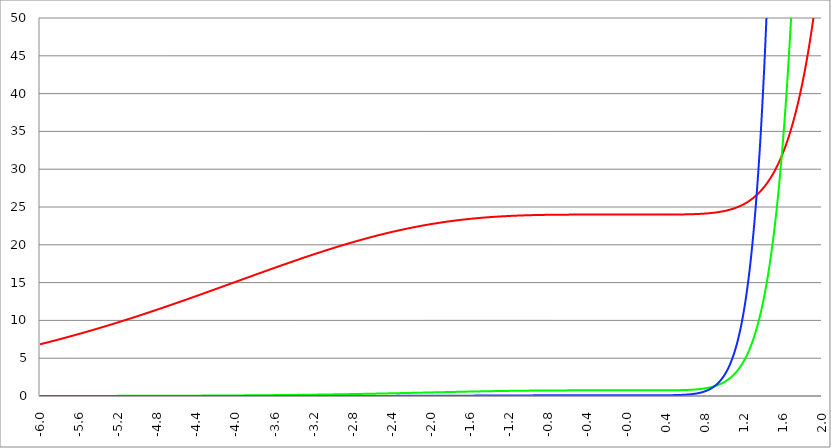
| Category | Series 1 | Series 0 | Series 2 |
|---|---|---|---|
| -6.0 | 6.841 | 0.006 | 0 |
| -5.996 | 6.854 | 0.006 | 0 |
| -5.992000000000001 | 6.867 | 0.006 | 0 |
| -5.988000000000001 | 6.88 | 0.006 | 0 |
| -5.984000000000002 | 6.893 | 0.006 | 0 |
| -5.980000000000002 | 6.906 | 0.006 | 0 |
| -5.976000000000002 | 6.919 | 0.006 | 0 |
| -5.972000000000003 | 6.932 | 0.006 | 0 |
| -5.968000000000003 | 6.945 | 0.006 | 0 |
| -5.964000000000004 | 6.958 | 0.006 | 0 |
| -5.960000000000004 | 6.971 | 0.006 | 0 |
| -5.956000000000004 | 6.984 | 0.006 | 0 |
| -5.952000000000005 | 6.997 | 0.006 | 0 |
| -5.948000000000005 | 7.01 | 0.006 | 0 |
| -5.944000000000006 | 7.023 | 0.006 | 0 |
| -5.940000000000006 | 7.036 | 0.006 | 0 |
| -5.936000000000007 | 7.049 | 0.006 | 0 |
| -5.932000000000007 | 7.062 | 0.006 | 0 |
| -5.928000000000008 | 7.075 | 0.006 | 0 |
| -5.924000000000008 | 7.089 | 0.006 | 0 |
| -5.920000000000009 | 7.102 | 0.006 | 0 |
| -5.91600000000001 | 7.115 | 0.006 | 0 |
| -5.91200000000001 | 7.128 | 0.006 | 0 |
| -5.90800000000001 | 7.141 | 0.006 | 0 |
| -5.904000000000011 | 7.155 | 0.007 | 0 |
| -5.900000000000011 | 7.168 | 0.007 | 0 |
| -5.896000000000011 | 7.181 | 0.007 | 0 |
| -5.892000000000012 | 7.195 | 0.007 | 0 |
| -5.888000000000012 | 7.208 | 0.007 | 0 |
| -5.884000000000013 | 7.221 | 0.007 | 0 |
| -5.880000000000013 | 7.235 | 0.007 | 0 |
| -5.876000000000014 | 7.248 | 0.007 | 0 |
| -5.872000000000014 | 7.261 | 0.007 | 0 |
| -5.868000000000014 | 7.275 | 0.007 | 0 |
| -5.864000000000015 | 7.288 | 0.007 | 0 |
| -5.860000000000015 | 7.302 | 0.007 | 0 |
| -5.856000000000016 | 7.315 | 0.007 | 0 |
| -5.852000000000016 | 7.329 | 0.007 | 0 |
| -5.848000000000017 | 7.342 | 0.007 | 0 |
| -5.844000000000017 | 7.356 | 0.007 | 0 |
| -5.840000000000018 | 7.369 | 0.007 | 0 |
| -5.836000000000018 | 7.383 | 0.007 | 0 |
| -5.832000000000018 | 7.396 | 0.007 | 0 |
| -5.828000000000019 | 7.41 | 0.007 | 0 |
| -5.824000000000019 | 7.423 | 0.007 | 0 |
| -5.82000000000002 | 7.437 | 0.007 | 0 |
| -5.81600000000002 | 7.451 | 0.007 | 0 |
| -5.812000000000021 | 7.464 | 0.007 | 0 |
| -5.808000000000021 | 7.478 | 0.007 | 0 |
| -5.804000000000022 | 7.492 | 0.007 | 0 |
| -5.800000000000022 | 7.505 | 0.008 | 0 |
| -5.796000000000022 | 7.519 | 0.008 | 0 |
| -5.792000000000023 | 7.533 | 0.008 | 0 |
| -5.788000000000023 | 7.546 | 0.008 | 0 |
| -5.784000000000024 | 7.56 | 0.008 | 0 |
| -5.780000000000024 | 7.574 | 0.008 | 0 |
| -5.776000000000024 | 7.588 | 0.008 | 0 |
| -5.772000000000025 | 7.602 | 0.008 | 0 |
| -5.768000000000025 | 7.615 | 0.008 | 0 |
| -5.764000000000026 | 7.629 | 0.008 | 0 |
| -5.760000000000026 | 7.643 | 0.008 | 0 |
| -5.756000000000026 | 7.657 | 0.008 | 0 |
| -5.752000000000027 | 7.671 | 0.008 | 0 |
| -5.748000000000027 | 7.685 | 0.008 | 0 |
| -5.744000000000028 | 7.699 | 0.008 | 0 |
| -5.740000000000028 | 7.713 | 0.008 | 0 |
| -5.73600000000003 | 7.727 | 0.008 | 0 |
| -5.73200000000003 | 7.741 | 0.008 | 0 |
| -5.72800000000003 | 7.755 | 0.008 | 0 |
| -5.72400000000003 | 7.769 | 0.008 | 0 |
| -5.720000000000031 | 7.783 | 0.008 | 0 |
| -5.716000000000031 | 7.797 | 0.008 | 0 |
| -5.712000000000032 | 7.811 | 0.008 | 0 |
| -5.708000000000032 | 7.825 | 0.009 | 0 |
| -5.704000000000033 | 7.839 | 0.009 | 0 |
| -5.700000000000033 | 7.853 | 0.009 | 0 |
| -5.696000000000033 | 7.867 | 0.009 | 0 |
| -5.692000000000034 | 7.881 | 0.009 | 0 |
| -5.688000000000034 | 7.896 | 0.009 | 0 |
| -5.684000000000035 | 7.91 | 0.009 | 0 |
| -5.680000000000035 | 7.924 | 0.009 | 0 |
| -5.676000000000035 | 7.938 | 0.009 | 0 |
| -5.672000000000036 | 7.952 | 0.009 | 0 |
| -5.668000000000036 | 7.967 | 0.009 | 0 |
| -5.664000000000037 | 7.981 | 0.009 | 0 |
| -5.660000000000037 | 7.995 | 0.009 | 0 |
| -5.656000000000038 | 8.01 | 0.009 | 0 |
| -5.652000000000038 | 8.024 | 0.009 | 0 |
| -5.648000000000039 | 8.038 | 0.009 | 0 |
| -5.644000000000039 | 8.053 | 0.009 | 0 |
| -5.64000000000004 | 8.067 | 0.009 | 0 |
| -5.63600000000004 | 8.081 | 0.009 | 0 |
| -5.63200000000004 | 8.096 | 0.009 | 0 |
| -5.628000000000041 | 8.11 | 0.01 | 0 |
| -5.624000000000041 | 8.125 | 0.01 | 0 |
| -5.620000000000042 | 8.139 | 0.01 | 0 |
| -5.616000000000042 | 8.154 | 0.01 | 0 |
| -5.612000000000043 | 8.168 | 0.01 | 0 |
| -5.608000000000043 | 8.183 | 0.01 | 0 |
| -5.604000000000044 | 8.197 | 0.01 | 0 |
| -5.600000000000044 | 8.212 | 0.01 | 0 |
| -5.596000000000044 | 8.226 | 0.01 | 0 |
| -5.592000000000045 | 8.241 | 0.01 | 0 |
| -5.588000000000045 | 8.255 | 0.01 | 0 |
| -5.584000000000046 | 8.27 | 0.01 | 0 |
| -5.580000000000046 | 8.285 | 0.01 | 0 |
| -5.576000000000046 | 8.299 | 0.01 | 0 |
| -5.572000000000047 | 8.314 | 0.01 | 0 |
| -5.568000000000048 | 8.329 | 0.01 | 0 |
| -5.564000000000048 | 8.343 | 0.01 | 0 |
| -5.560000000000048 | 8.358 | 0.01 | 0 |
| -5.556000000000049 | 8.373 | 0.011 | 0 |
| -5.552000000000049 | 8.387 | 0.011 | 0 |
| -5.54800000000005 | 8.402 | 0.011 | 0 |
| -5.54400000000005 | 8.417 | 0.011 | 0 |
| -5.540000000000051 | 8.432 | 0.011 | 0 |
| -5.536000000000051 | 8.446 | 0.011 | 0 |
| -5.532000000000052 | 8.461 | 0.011 | 0 |
| -5.528000000000052 | 8.476 | 0.011 | 0 |
| -5.524000000000052 | 8.491 | 0.011 | 0 |
| -5.520000000000053 | 8.506 | 0.011 | 0 |
| -5.516000000000053 | 8.521 | 0.011 | 0 |
| -5.512000000000054 | 8.536 | 0.011 | 0 |
| -5.508000000000054 | 8.551 | 0.011 | 0 |
| -5.504000000000055 | 8.565 | 0.011 | 0 |
| -5.500000000000055 | 8.58 | 0.011 | 0 |
| -5.496000000000055 | 8.595 | 0.011 | 0 |
| -5.492000000000056 | 8.61 | 0.011 | 0 |
| -5.488000000000056 | 8.625 | 0.012 | 0 |
| -5.484000000000057 | 8.64 | 0.012 | 0 |
| -5.480000000000057 | 8.655 | 0.012 | 0 |
| -5.476000000000057 | 8.67 | 0.012 | 0 |
| -5.472000000000058 | 8.686 | 0.012 | 0 |
| -5.468000000000059 | 8.701 | 0.012 | 0 |
| -5.464000000000059 | 8.716 | 0.012 | 0 |
| -5.460000000000059 | 8.731 | 0.012 | 0 |
| -5.45600000000006 | 8.746 | 0.012 | 0 |
| -5.45200000000006 | 8.761 | 0.012 | 0 |
| -5.44800000000006 | 8.776 | 0.012 | 0 |
| -5.444000000000061 | 8.791 | 0.012 | 0 |
| -5.440000000000061 | 8.807 | 0.012 | 0 |
| -5.436000000000062 | 8.822 | 0.012 | 0 |
| -5.432000000000062 | 8.837 | 0.012 | 0 |
| -5.428000000000063 | 8.852 | 0.012 | 0 |
| -5.424000000000063 | 8.868 | 0.013 | 0 |
| -5.420000000000064 | 8.883 | 0.013 | 0 |
| -5.416000000000064 | 8.898 | 0.013 | 0 |
| -5.412000000000064 | 8.913 | 0.013 | 0 |
| -5.408000000000065 | 8.929 | 0.013 | 0 |
| -5.404000000000065 | 8.944 | 0.013 | 0 |
| -5.400000000000066 | 8.959 | 0.013 | 0 |
| -5.396000000000066 | 8.975 | 0.013 | 0 |
| -5.392000000000067 | 8.99 | 0.013 | 0 |
| -5.388000000000067 | 9.006 | 0.013 | 0 |
| -5.384000000000068 | 9.021 | 0.013 | 0 |
| -5.380000000000068 | 9.036 | 0.013 | 0 |
| -5.376000000000068 | 9.052 | 0.013 | 0 |
| -5.37200000000007 | 9.067 | 0.013 | 0 |
| -5.36800000000007 | 9.083 | 0.014 | 0 |
| -5.36400000000007 | 9.098 | 0.014 | 0 |
| -5.36000000000007 | 9.114 | 0.014 | 0 |
| -5.356000000000071 | 9.129 | 0.014 | 0 |
| -5.352000000000071 | 9.145 | 0.014 | 0 |
| -5.348000000000072 | 9.161 | 0.014 | 0 |
| -5.344000000000072 | 9.176 | 0.014 | 0 |
| -5.340000000000073 | 9.192 | 0.014 | 0 |
| -5.336000000000073 | 9.207 | 0.014 | 0 |
| -5.332000000000074 | 9.223 | 0.014 | 0 |
| -5.328000000000074 | 9.239 | 0.014 | 0 |
| -5.324000000000074 | 9.254 | 0.014 | 0 |
| -5.320000000000075 | 9.27 | 0.014 | 0 |
| -5.316000000000075 | 9.286 | 0.014 | 0 |
| -5.312000000000076 | 9.301 | 0.015 | 0 |
| -5.308000000000076 | 9.317 | 0.015 | 0 |
| -5.304000000000077 | 9.333 | 0.015 | 0 |
| -5.300000000000077 | 9.348 | 0.015 | 0 |
| -5.296000000000077 | 9.364 | 0.015 | 0 |
| -5.292000000000078 | 9.38 | 0.015 | 0 |
| -5.288000000000078 | 9.396 | 0.015 | 0 |
| -5.284000000000079 | 9.412 | 0.015 | 0 |
| -5.28000000000008 | 9.427 | 0.015 | 0 |
| -5.27600000000008 | 9.443 | 0.015 | 0 |
| -5.27200000000008 | 9.459 | 0.015 | 0 |
| -5.268000000000081 | 9.475 | 0.015 | 0 |
| -5.264000000000081 | 9.491 | 0.016 | 0 |
| -5.260000000000081 | 9.507 | 0.016 | 0 |
| -5.256000000000082 | 9.523 | 0.016 | 0 |
| -5.252000000000082 | 9.539 | 0.016 | 0 |
| -5.248000000000083 | 9.555 | 0.016 | 0 |
| -5.244000000000083 | 9.571 | 0.016 | 0 |
| -5.240000000000084 | 9.586 | 0.016 | 0 |
| -5.236000000000084 | 9.602 | 0.016 | 0 |
| -5.232000000000084 | 9.618 | 0.016 | 0 |
| -5.228000000000085 | 9.635 | 0.016 | 0 |
| -5.224000000000085 | 9.651 | 0.016 | 0 |
| -5.220000000000086 | 9.667 | 0.016 | 0 |
| -5.216000000000086 | 9.683 | 0.017 | 0 |
| -5.212000000000087 | 9.699 | 0.017 | 0 |
| -5.208000000000087 | 9.715 | 0.017 | 0 |
| -5.204000000000088 | 9.731 | 0.017 | 0 |
| -5.200000000000088 | 9.747 | 0.017 | 0 |
| -5.196000000000089 | 9.763 | 0.017 | 0 |
| -5.192000000000089 | 9.779 | 0.017 | 0 |
| -5.188000000000089 | 9.796 | 0.017 | 0 |
| -5.18400000000009 | 9.812 | 0.017 | 0 |
| -5.18000000000009 | 9.828 | 0.017 | 0 |
| -5.176000000000091 | 9.844 | 0.017 | 0 |
| -5.172000000000091 | 9.86 | 0.018 | 0 |
| -5.168000000000092 | 9.877 | 0.018 | 0 |
| -5.164000000000092 | 9.893 | 0.018 | 0 |
| -5.160000000000092 | 9.909 | 0.018 | 0 |
| -5.156000000000093 | 9.925 | 0.018 | 0 |
| -5.152000000000093 | 9.942 | 0.018 | 0 |
| -5.148000000000094 | 9.958 | 0.018 | 0 |
| -5.144000000000094 | 9.974 | 0.018 | 0 |
| -5.140000000000095 | 9.991 | 0.018 | 0 |
| -5.136000000000095 | 10.007 | 0.018 | 0 |
| -5.132000000000096 | 10.023 | 0.018 | 0 |
| -5.128000000000096 | 10.04 | 0.019 | 0 |
| -5.124000000000096 | 10.056 | 0.019 | 0 |
| -5.120000000000097 | 10.073 | 0.019 | 0 |
| -5.116000000000097 | 10.089 | 0.019 | 0 |
| -5.112000000000098 | 10.106 | 0.019 | 0 |
| -5.108000000000098 | 10.122 | 0.019 | 0 |
| -5.104000000000099 | 10.139 | 0.019 | 0 |
| -5.100000000000099 | 10.155 | 0.019 | 0 |
| -5.0960000000001 | 10.172 | 0.019 | 0 |
| -5.0920000000001 | 10.188 | 0.019 | 0 |
| -5.0880000000001 | 10.205 | 0.02 | 0 |
| -5.084000000000101 | 10.221 | 0.02 | 0 |
| -5.080000000000101 | 10.238 | 0.02 | 0 |
| -5.076000000000101 | 10.254 | 0.02 | 0 |
| -5.072000000000102 | 10.271 | 0.02 | 0 |
| -5.068000000000103 | 10.287 | 0.02 | 0 |
| -5.064000000000103 | 10.304 | 0.02 | 0 |
| -5.060000000000104 | 10.321 | 0.02 | 0 |
| -5.056000000000104 | 10.337 | 0.02 | 0 |
| -5.052000000000104 | 10.354 | 0.021 | 0 |
| -5.048000000000104 | 10.371 | 0.021 | 0 |
| -5.044000000000105 | 10.387 | 0.021 | 0 |
| -5.040000000000105 | 10.404 | 0.021 | 0 |
| -5.036000000000106 | 10.421 | 0.021 | 0 |
| -5.032000000000106 | 10.438 | 0.021 | 0 |
| -5.028000000000107 | 10.454 | 0.021 | 0 |
| -5.024000000000107 | 10.471 | 0.021 | 0 |
| -5.020000000000108 | 10.488 | 0.021 | 0 |
| -5.016000000000108 | 10.505 | 0.021 | 0 |
| -5.012000000000109 | 10.521 | 0.022 | 0 |
| -5.00800000000011 | 10.538 | 0.022 | 0 |
| -5.00400000000011 | 10.555 | 0.022 | 0 |
| -5.00000000000011 | 10.572 | 0.022 | 0 |
| -4.99600000000011 | 10.589 | 0.022 | 0 |
| -4.992000000000111 | 10.606 | 0.022 | 0 |
| -4.988000000000111 | 10.622 | 0.022 | 0 |
| -4.984000000000112 | 10.639 | 0.022 | 0 |
| -4.980000000000112 | 10.656 | 0.023 | 0 |
| -4.976000000000112 | 10.673 | 0.023 | 0 |
| -4.972000000000113 | 10.69 | 0.023 | 0 |
| -4.968000000000114 | 10.707 | 0.023 | 0 |
| -4.964000000000114 | 10.724 | 0.023 | 0 |
| -4.960000000000114 | 10.741 | 0.023 | 0 |
| -4.956000000000114 | 10.758 | 0.023 | 0 |
| -4.952000000000115 | 10.775 | 0.023 | 0 |
| -4.948000000000115 | 10.792 | 0.023 | 0 |
| -4.944000000000116 | 10.809 | 0.024 | 0 |
| -4.940000000000116 | 10.826 | 0.024 | 0 |
| -4.936000000000117 | 10.843 | 0.024 | 0 |
| -4.932000000000117 | 10.86 | 0.024 | 0 |
| -4.928000000000118 | 10.877 | 0.024 | 0 |
| -4.924000000000118 | 10.894 | 0.024 | 0 |
| -4.920000000000119 | 10.911 | 0.024 | 0 |
| -4.91600000000012 | 10.929 | 0.024 | 0 |
| -4.91200000000012 | 10.946 | 0.025 | 0 |
| -4.90800000000012 | 10.963 | 0.025 | 0 |
| -4.90400000000012 | 10.98 | 0.025 | 0 |
| -4.90000000000012 | 10.997 | 0.025 | 0 |
| -4.896000000000121 | 11.014 | 0.025 | 0 |
| -4.892000000000122 | 11.031 | 0.025 | 0 |
| -4.888000000000122 | 11.049 | 0.025 | 0 |
| -4.884000000000123 | 11.066 | 0.025 | 0 |
| -4.880000000000123 | 11.083 | 0.026 | 0 |
| -4.876000000000123 | 11.1 | 0.026 | 0 |
| -4.872000000000124 | 11.118 | 0.026 | 0 |
| -4.868000000000124 | 11.135 | 0.026 | 0 |
| -4.864000000000125 | 11.152 | 0.026 | 0 |
| -4.860000000000125 | 11.169 | 0.026 | 0 |
| -4.856000000000125 | 11.187 | 0.026 | 0 |
| -4.852000000000126 | 11.204 | 0.027 | 0 |
| -4.848000000000126 | 11.221 | 0.027 | 0 |
| -4.844000000000127 | 11.239 | 0.027 | 0 |
| -4.840000000000127 | 11.256 | 0.027 | 0 |
| -4.836000000000128 | 11.273 | 0.027 | 0 |
| -4.832000000000128 | 11.291 | 0.027 | 0 |
| -4.82800000000013 | 11.308 | 0.027 | 0 |
| -4.824000000000129 | 11.326 | 0.027 | 0 |
| -4.82000000000013 | 11.343 | 0.028 | 0 |
| -4.81600000000013 | 11.36 | 0.028 | 0 |
| -4.812000000000131 | 11.378 | 0.028 | 0 |
| -4.808000000000131 | 11.395 | 0.028 | 0 |
| -4.804000000000132 | 11.413 | 0.028 | 0 |
| -4.800000000000132 | 11.43 | 0.028 | 0 |
| -4.796000000000132 | 11.448 | 0.028 | 0 |
| -4.792000000000133 | 11.465 | 0.029 | 0 |
| -4.788000000000133 | 11.483 | 0.029 | 0 |
| -4.784000000000134 | 11.5 | 0.029 | 0 |
| -4.780000000000134 | 11.518 | 0.029 | 0 |
| -4.776000000000134 | 11.535 | 0.029 | 0 |
| -4.772000000000135 | 11.553 | 0.029 | 0 |
| -4.768000000000135 | 11.57 | 0.03 | 0 |
| -4.764000000000136 | 11.588 | 0.03 | 0 |
| -4.760000000000136 | 11.606 | 0.03 | 0 |
| -4.756000000000136 | 11.623 | 0.03 | 0 |
| -4.752000000000137 | 11.641 | 0.03 | 0 |
| -4.748000000000137 | 11.658 | 0.03 | 0 |
| -4.744000000000138 | 11.676 | 0.03 | 0 |
| -4.740000000000138 | 11.694 | 0.031 | 0 |
| -4.73600000000014 | 11.711 | 0.031 | 0 |
| -4.73200000000014 | 11.729 | 0.031 | 0 |
| -4.72800000000014 | 11.747 | 0.031 | 0 |
| -4.72400000000014 | 11.764 | 0.031 | 0 |
| -4.720000000000141 | 11.782 | 0.031 | 0 |
| -4.716000000000141 | 11.8 | 0.032 | 0 |
| -4.712000000000142 | 11.817 | 0.032 | 0 |
| -4.708000000000142 | 11.835 | 0.032 | 0 |
| -4.704000000000143 | 11.853 | 0.032 | 0 |
| -4.700000000000143 | 11.871 | 0.032 | 0 |
| -4.696000000000143 | 11.888 | 0.032 | 0 |
| -4.692000000000144 | 11.906 | 0.032 | 0 |
| -4.688000000000144 | 11.924 | 0.033 | 0 |
| -4.684000000000145 | 11.942 | 0.033 | 0 |
| -4.680000000000145 | 11.96 | 0.033 | 0 |
| -4.676000000000145 | 11.977 | 0.033 | 0 |
| -4.672000000000146 | 11.995 | 0.033 | 0 |
| -4.668000000000147 | 12.013 | 0.033 | 0 |
| -4.664000000000147 | 12.031 | 0.034 | 0 |
| -4.660000000000147 | 12.049 | 0.034 | 0 |
| -4.656000000000148 | 12.067 | 0.034 | 0 |
| -4.652000000000148 | 12.084 | 0.034 | 0 |
| -4.648000000000149 | 12.102 | 0.034 | 0 |
| -4.644000000000149 | 12.12 | 0.034 | 0 |
| -4.64000000000015 | 12.138 | 0.035 | 0 |
| -4.63600000000015 | 12.156 | 0.035 | 0 |
| -4.632000000000151 | 12.174 | 0.035 | 0 |
| -4.628000000000151 | 12.192 | 0.035 | 0 |
| -4.624000000000151 | 12.21 | 0.035 | 0 |
| -4.620000000000152 | 12.228 | 0.036 | 0 |
| -4.616000000000152 | 12.246 | 0.036 | 0 |
| -4.612000000000153 | 12.264 | 0.036 | 0 |
| -4.608000000000153 | 12.282 | 0.036 | 0 |
| -4.604000000000154 | 12.3 | 0.036 | 0 |
| -4.600000000000154 | 12.318 | 0.036 | 0 |
| -4.596000000000154 | 12.336 | 0.037 | 0 |
| -4.592000000000155 | 12.354 | 0.037 | 0 |
| -4.588000000000155 | 12.372 | 0.037 | 0 |
| -4.584000000000156 | 12.39 | 0.037 | 0 |
| -4.580000000000156 | 12.408 | 0.037 | 0 |
| -4.576000000000156 | 12.426 | 0.038 | 0 |
| -4.572000000000157 | 12.444 | 0.038 | 0 |
| -4.568000000000158 | 12.462 | 0.038 | 0 |
| -4.564000000000158 | 12.48 | 0.038 | 0 |
| -4.560000000000159 | 12.498 | 0.038 | 0 |
| -4.55600000000016 | 12.516 | 0.038 | 0 |
| -4.552000000000159 | 12.534 | 0.039 | 0 |
| -4.54800000000016 | 12.552 | 0.039 | 0 |
| -4.54400000000016 | 12.571 | 0.039 | 0 |
| -4.54000000000016 | 12.589 | 0.039 | 0 |
| -4.53600000000016 | 12.607 | 0.039 | 0 |
| -4.532000000000161 | 12.625 | 0.04 | 0 |
| -4.528000000000162 | 12.643 | 0.04 | 0 |
| -4.524000000000163 | 12.661 | 0.04 | 0 |
| -4.520000000000163 | 12.679 | 0.04 | 0 |
| -4.516000000000163 | 12.698 | 0.04 | 0 |
| -4.512000000000164 | 12.716 | 0.041 | 0 |
| -4.508000000000164 | 12.734 | 0.041 | 0 |
| -4.504000000000164 | 12.752 | 0.041 | 0 |
| -4.500000000000165 | 12.77 | 0.041 | 0 |
| -4.496000000000165 | 12.789 | 0.041 | 0 |
| -4.492000000000166 | 12.807 | 0.042 | 0 |
| -4.488000000000166 | 12.825 | 0.042 | 0 |
| -4.484000000000166 | 12.843 | 0.042 | 0 |
| -4.480000000000167 | 12.862 | 0.042 | 0 |
| -4.476000000000167 | 12.88 | 0.042 | 0 |
| -4.472000000000168 | 12.898 | 0.043 | 0 |
| -4.468000000000168 | 12.917 | 0.043 | 0 |
| -4.46400000000017 | 12.935 | 0.043 | 0 |
| -4.46000000000017 | 12.953 | 0.043 | 0 |
| -4.45600000000017 | 12.971 | 0.044 | 0 |
| -4.45200000000017 | 12.99 | 0.044 | 0 |
| -4.44800000000017 | 13.008 | 0.044 | 0 |
| -4.444000000000171 | 13.026 | 0.044 | 0 |
| -4.440000000000171 | 13.045 | 0.044 | 0 |
| -4.436000000000172 | 13.063 | 0.045 | 0 |
| -4.432000000000172 | 13.081 | 0.045 | 0 |
| -4.428000000000173 | 13.1 | 0.045 | 0 |
| -4.424000000000174 | 13.118 | 0.045 | 0 |
| -4.420000000000174 | 13.136 | 0.045 | 0 |
| -4.416000000000174 | 13.155 | 0.046 | 0 |
| -4.412000000000174 | 13.173 | 0.046 | 0 |
| -4.408000000000175 | 13.192 | 0.046 | 0 |
| -4.404000000000175 | 13.21 | 0.046 | 0 |
| -4.400000000000176 | 13.228 | 0.047 | 0 |
| -4.396000000000176 | 13.247 | 0.047 | 0 |
| -4.392000000000177 | 13.265 | 0.047 | 0 |
| -4.388000000000177 | 13.284 | 0.047 | 0 |
| -4.384000000000178 | 13.302 | 0.047 | 0 |
| -4.380000000000178 | 13.321 | 0.048 | 0 |
| -4.376000000000178 | 13.339 | 0.048 | 0 |
| -4.37200000000018 | 13.357 | 0.048 | 0 |
| -4.36800000000018 | 13.376 | 0.048 | 0 |
| -4.36400000000018 | 13.394 | 0.049 | 0 |
| -4.360000000000181 | 13.413 | 0.049 | 0 |
| -4.356000000000181 | 13.431 | 0.049 | 0 |
| -4.352000000000181 | 13.45 | 0.049 | 0 |
| -4.348000000000182 | 13.468 | 0.05 | 0 |
| -4.344000000000182 | 13.487 | 0.05 | 0 |
| -4.340000000000183 | 13.505 | 0.05 | 0 |
| -4.336000000000183 | 13.524 | 0.05 | 0 |
| -4.332000000000184 | 13.542 | 0.051 | 0 |
| -4.328000000000184 | 13.561 | 0.051 | 0 |
| -4.324000000000185 | 13.579 | 0.051 | 0 |
| -4.320000000000185 | 13.598 | 0.051 | 0 |
| -4.316000000000185 | 13.616 | 0.052 | 0 |
| -4.312000000000186 | 13.635 | 0.052 | 0 |
| -4.308000000000186 | 13.653 | 0.052 | 0 |
| -4.304000000000187 | 13.672 | 0.052 | 0 |
| -4.300000000000187 | 13.691 | 0.053 | 0 |
| -4.296000000000187 | 13.709 | 0.053 | 0 |
| -4.292000000000188 | 13.728 | 0.053 | 0 |
| -4.288000000000188 | 13.746 | 0.053 | 0 |
| -4.284000000000189 | 13.765 | 0.054 | 0 |
| -4.28000000000019 | 13.783 | 0.054 | 0 |
| -4.27600000000019 | 13.802 | 0.054 | 0 |
| -4.27200000000019 | 13.821 | 0.054 | 0 |
| -4.268000000000191 | 13.839 | 0.055 | 0 |
| -4.264000000000191 | 13.858 | 0.055 | 0 |
| -4.260000000000192 | 13.876 | 0.055 | 0 |
| -4.256000000000192 | 13.895 | 0.055 | 0 |
| -4.252000000000192 | 13.914 | 0.056 | 0 |
| -4.248000000000193 | 13.932 | 0.056 | 0 |
| -4.244000000000193 | 13.951 | 0.056 | 0 |
| -4.240000000000194 | 13.969 | 0.056 | 0 |
| -4.236000000000194 | 13.988 | 0.057 | 0 |
| -4.232000000000194 | 14.007 | 0.057 | 0 |
| -4.228000000000195 | 14.025 | 0.057 | 0 |
| -4.224000000000196 | 14.044 | 0.058 | 0 |
| -4.220000000000196 | 14.063 | 0.058 | 0 |
| -4.216000000000196 | 14.081 | 0.058 | 0 |
| -4.212000000000197 | 14.1 | 0.058 | 0 |
| -4.208000000000197 | 14.119 | 0.059 | 0 |
| -4.204000000000198 | 14.137 | 0.059 | 0 |
| -4.200000000000198 | 14.156 | 0.059 | 0 |
| -4.196000000000199 | 14.175 | 0.059 | 0 |
| -4.192000000000199 | 14.193 | 0.06 | 0.001 |
| -4.1880000000002 | 14.212 | 0.06 | 0.001 |
| -4.1840000000002 | 14.231 | 0.06 | 0.001 |
| -4.1800000000002 | 14.249 | 0.061 | 0.001 |
| -4.176000000000201 | 14.268 | 0.061 | 0.001 |
| -4.172000000000201 | 14.287 | 0.061 | 0.001 |
| -4.168000000000202 | 14.305 | 0.061 | 0.001 |
| -4.164000000000202 | 14.324 | 0.062 | 0.001 |
| -4.160000000000203 | 14.343 | 0.062 | 0.001 |
| -4.156000000000203 | 14.361 | 0.062 | 0.001 |
| -4.152000000000204 | 14.38 | 0.063 | 0.001 |
| -4.148000000000204 | 14.399 | 0.063 | 0.001 |
| -4.144000000000204 | 14.417 | 0.063 | 0.001 |
| -4.140000000000205 | 14.436 | 0.064 | 0.001 |
| -4.136000000000205 | 14.455 | 0.064 | 0.001 |
| -4.132000000000206 | 14.474 | 0.064 | 0.001 |
| -4.128000000000206 | 14.492 | 0.064 | 0.001 |
| -4.124000000000207 | 14.511 | 0.065 | 0.001 |
| -4.120000000000207 | 14.53 | 0.065 | 0.001 |
| -4.116000000000207 | 14.548 | 0.065 | 0.001 |
| -4.112000000000208 | 14.567 | 0.066 | 0.001 |
| -4.108000000000208 | 14.586 | 0.066 | 0.001 |
| -4.104000000000209 | 14.605 | 0.066 | 0.001 |
| -4.100000000000209 | 14.623 | 0.067 | 0.001 |
| -4.09600000000021 | 14.642 | 0.067 | 0.001 |
| -4.09200000000021 | 14.661 | 0.067 | 0.001 |
| -4.088000000000211 | 14.68 | 0.067 | 0.001 |
| -4.084000000000211 | 14.698 | 0.068 | 0.001 |
| -4.080000000000211 | 14.717 | 0.068 | 0.001 |
| -4.076000000000212 | 14.736 | 0.068 | 0.001 |
| -4.072000000000212 | 14.755 | 0.069 | 0.001 |
| -4.068000000000213 | 14.773 | 0.069 | 0.001 |
| -4.064000000000213 | 14.792 | 0.069 | 0.001 |
| -4.060000000000214 | 14.811 | 0.07 | 0.001 |
| -4.056000000000214 | 14.83 | 0.07 | 0.001 |
| -4.052000000000215 | 14.848 | 0.07 | 0.001 |
| -4.048000000000215 | 14.867 | 0.071 | 0.001 |
| -4.044000000000215 | 14.886 | 0.071 | 0.001 |
| -4.040000000000216 | 14.905 | 0.071 | 0.001 |
| -4.036000000000216 | 14.923 | 0.072 | 0.001 |
| -4.032000000000217 | 14.942 | 0.072 | 0.001 |
| -4.028000000000217 | 14.961 | 0.072 | 0.001 |
| -4.024000000000218 | 14.98 | 0.073 | 0.001 |
| -4.020000000000218 | 14.998 | 0.073 | 0.001 |
| -4.016000000000219 | 15.017 | 0.073 | 0.001 |
| -4.012000000000219 | 15.036 | 0.074 | 0.001 |
| -4.008000000000219 | 15.055 | 0.074 | 0.001 |
| -4.00400000000022 | 15.073 | 0.074 | 0.001 |
| -4.00000000000022 | 15.092 | 0.075 | 0.001 |
| -3.99600000000022 | 15.111 | 0.075 | 0.001 |
| -3.99200000000022 | 15.13 | 0.075 | 0.001 |
| -3.98800000000022 | 15.148 | 0.076 | 0.001 |
| -3.98400000000022 | 15.167 | 0.076 | 0.001 |
| -3.98000000000022 | 15.186 | 0.076 | 0.001 |
| -3.97600000000022 | 15.205 | 0.077 | 0.001 |
| -3.97200000000022 | 15.223 | 0.077 | 0.001 |
| -3.96800000000022 | 15.242 | 0.078 | 0.001 |
| -3.96400000000022 | 15.261 | 0.078 | 0.001 |
| -3.96000000000022 | 15.28 | 0.078 | 0.001 |
| -3.95600000000022 | 15.298 | 0.079 | 0.001 |
| -3.95200000000022 | 15.317 | 0.079 | 0.001 |
| -3.94800000000022 | 15.336 | 0.079 | 0.001 |
| -3.94400000000022 | 15.355 | 0.08 | 0.001 |
| -3.94000000000022 | 15.373 | 0.08 | 0.001 |
| -3.93600000000022 | 15.392 | 0.08 | 0.001 |
| -3.93200000000022 | 15.411 | 0.081 | 0.001 |
| -3.92800000000022 | 15.43 | 0.081 | 0.001 |
| -3.92400000000022 | 15.448 | 0.082 | 0.001 |
| -3.92000000000022 | 15.467 | 0.082 | 0.001 |
| -3.91600000000022 | 15.486 | 0.082 | 0.001 |
| -3.91200000000022 | 15.505 | 0.083 | 0.001 |
| -3.90800000000022 | 15.523 | 0.083 | 0.001 |
| -3.90400000000022 | 15.542 | 0.083 | 0.001 |
| -3.90000000000022 | 15.561 | 0.084 | 0.001 |
| -3.89600000000022 | 15.579 | 0.084 | 0.001 |
| -3.89200000000022 | 15.598 | 0.085 | 0.001 |
| -3.88800000000022 | 15.617 | 0.085 | 0.001 |
| -3.88400000000022 | 15.636 | 0.085 | 0.001 |
| -3.88000000000022 | 15.654 | 0.086 | 0.001 |
| -3.87600000000022 | 15.673 | 0.086 | 0.001 |
| -3.87200000000022 | 15.692 | 0.086 | 0.001 |
| -3.86800000000022 | 15.711 | 0.087 | 0.001 |
| -3.86400000000022 | 15.729 | 0.087 | 0.001 |
| -3.86000000000022 | 15.748 | 0.088 | 0.001 |
| -3.85600000000022 | 15.767 | 0.088 | 0.001 |
| -3.85200000000022 | 15.785 | 0.088 | 0.001 |
| -3.84800000000022 | 15.804 | 0.089 | 0.001 |
| -3.84400000000022 | 15.823 | 0.089 | 0.001 |
| -3.84000000000022 | 15.841 | 0.09 | 0.001 |
| -3.83600000000022 | 15.86 | 0.09 | 0.001 |
| -3.83200000000022 | 15.879 | 0.09 | 0.001 |
| -3.82800000000022 | 15.898 | 0.091 | 0.001 |
| -3.82400000000022 | 15.916 | 0.091 | 0.001 |
| -3.82000000000022 | 15.935 | 0.092 | 0.001 |
| -3.81600000000022 | 15.954 | 0.092 | 0.001 |
| -3.81200000000022 | 15.972 | 0.092 | 0.001 |
| -3.80800000000022 | 15.991 | 0.093 | 0.001 |
| -3.80400000000022 | 16.01 | 0.093 | 0.001 |
| -3.80000000000022 | 16.028 | 0.094 | 0.001 |
| -3.79600000000022 | 16.047 | 0.094 | 0.001 |
| -3.79200000000022 | 16.066 | 0.095 | 0.001 |
| -3.78800000000022 | 16.084 | 0.095 | 0.001 |
| -3.78400000000022 | 16.103 | 0.095 | 0.001 |
| -3.78000000000022 | 16.121 | 0.096 | 0.001 |
| -3.77600000000022 | 16.14 | 0.096 | 0.001 |
| -3.77200000000022 | 16.159 | 0.097 | 0.001 |
| -3.76800000000022 | 16.177 | 0.097 | 0.001 |
| -3.76400000000022 | 16.196 | 0.098 | 0.001 |
| -3.76000000000022 | 16.215 | 0.098 | 0.001 |
| -3.75600000000022 | 16.233 | 0.098 | 0.001 |
| -3.75200000000022 | 16.252 | 0.099 | 0.001 |
| -3.74800000000022 | 16.27 | 0.099 | 0.001 |
| -3.74400000000022 | 16.289 | 0.1 | 0.001 |
| -3.74000000000022 | 16.308 | 0.1 | 0.001 |
| -3.73600000000022 | 16.326 | 0.101 | 0.001 |
| -3.73200000000022 | 16.345 | 0.101 | 0.001 |
| -3.72800000000022 | 16.363 | 0.101 | 0.001 |
| -3.72400000000022 | 16.382 | 0.102 | 0.001 |
| -3.72000000000022 | 16.401 | 0.102 | 0.001 |
| -3.71600000000022 | 16.419 | 0.103 | 0.001 |
| -3.71200000000022 | 16.438 | 0.103 | 0.001 |
| -3.70800000000022 | 16.456 | 0.104 | 0.001 |
| -3.70400000000022 | 16.475 | 0.104 | 0.001 |
| -3.70000000000022 | 16.493 | 0.105 | 0.001 |
| -3.69600000000022 | 16.512 | 0.105 | 0.001 |
| -3.69200000000022 | 16.53 | 0.106 | 0.001 |
| -3.68800000000022 | 16.549 | 0.106 | 0.001 |
| -3.68400000000022 | 16.567 | 0.106 | 0.001 |
| -3.68000000000022 | 16.586 | 0.107 | 0.001 |
| -3.67600000000022 | 16.604 | 0.107 | 0.001 |
| -3.67200000000022 | 16.623 | 0.108 | 0.001 |
| -3.66800000000022 | 16.641 | 0.108 | 0.001 |
| -3.66400000000022 | 16.66 | 0.109 | 0.001 |
| -3.66000000000022 | 16.678 | 0.109 | 0.002 |
| -3.65600000000022 | 16.697 | 0.11 | 0.002 |
| -3.65200000000022 | 16.715 | 0.11 | 0.002 |
| -3.64800000000022 | 16.734 | 0.111 | 0.002 |
| -3.64400000000022 | 16.752 | 0.111 | 0.002 |
| -3.64000000000022 | 16.771 | 0.112 | 0.002 |
| -3.63600000000022 | 16.789 | 0.112 | 0.002 |
| -3.63200000000022 | 16.807 | 0.113 | 0.002 |
| -3.62800000000022 | 16.826 | 0.113 | 0.002 |
| -3.62400000000022 | 16.844 | 0.114 | 0.002 |
| -3.62000000000022 | 16.863 | 0.114 | 0.002 |
| -3.61600000000022 | 16.881 | 0.115 | 0.002 |
| -3.61200000000022 | 16.899 | 0.115 | 0.002 |
| -3.60800000000022 | 16.918 | 0.116 | 0.002 |
| -3.60400000000022 | 16.936 | 0.116 | 0.002 |
| -3.60000000000022 | 16.955 | 0.117 | 0.002 |
| -3.59600000000022 | 16.973 | 0.117 | 0.002 |
| -3.59200000000022 | 16.991 | 0.118 | 0.002 |
| -3.58800000000022 | 17.01 | 0.118 | 0.002 |
| -3.58400000000022 | 17.028 | 0.119 | 0.002 |
| -3.58000000000022 | 17.046 | 0.119 | 0.002 |
| -3.57600000000022 | 17.065 | 0.12 | 0.002 |
| -3.57200000000022 | 17.083 | 0.12 | 0.002 |
| -3.56800000000022 | 17.101 | 0.121 | 0.002 |
| -3.56400000000022 | 17.119 | 0.121 | 0.002 |
| -3.56000000000022 | 17.138 | 0.122 | 0.002 |
| -3.55600000000022 | 17.156 | 0.122 | 0.002 |
| -3.55200000000022 | 17.174 | 0.123 | 0.002 |
| -3.54800000000022 | 17.192 | 0.123 | 0.002 |
| -3.54400000000022 | 17.211 | 0.124 | 0.002 |
| -3.54000000000022 | 17.229 | 0.124 | 0.002 |
| -3.53600000000022 | 17.247 | 0.125 | 0.002 |
| -3.53200000000022 | 17.265 | 0.125 | 0.002 |
| -3.52800000000022 | 17.284 | 0.126 | 0.002 |
| -3.52400000000022 | 17.302 | 0.126 | 0.002 |
| -3.52000000000022 | 17.32 | 0.127 | 0.002 |
| -3.51600000000022 | 17.338 | 0.128 | 0.002 |
| -3.51200000000022 | 17.356 | 0.128 | 0.002 |
| -3.50800000000022 | 17.374 | 0.129 | 0.002 |
| -3.50400000000022 | 17.393 | 0.129 | 0.002 |
| -3.50000000000022 | 17.411 | 0.13 | 0.002 |
| -3.49600000000022 | 17.429 | 0.13 | 0.002 |
| -3.49200000000022 | 17.447 | 0.131 | 0.002 |
| -3.48800000000022 | 17.465 | 0.131 | 0.002 |
| -3.48400000000022 | 17.483 | 0.132 | 0.002 |
| -3.48000000000022 | 17.501 | 0.133 | 0.002 |
| -3.47600000000022 | 17.519 | 0.133 | 0.002 |
| -3.47200000000022 | 17.537 | 0.134 | 0.002 |
| -3.46800000000022 | 17.555 | 0.134 | 0.002 |
| -3.46400000000022 | 17.573 | 0.135 | 0.002 |
| -3.46000000000022 | 17.591 | 0.135 | 0.002 |
| -3.45600000000022 | 17.609 | 0.136 | 0.002 |
| -3.45200000000022 | 17.627 | 0.136 | 0.002 |
| -3.44800000000022 | 17.645 | 0.137 | 0.002 |
| -3.44400000000022 | 17.663 | 0.138 | 0.002 |
| -3.44000000000022 | 17.681 | 0.138 | 0.002 |
| -3.43600000000022 | 17.699 | 0.139 | 0.002 |
| -3.43200000000022 | 17.717 | 0.139 | 0.002 |
| -3.42800000000022 | 17.735 | 0.14 | 0.002 |
| -3.42400000000022 | 17.753 | 0.14 | 0.002 |
| -3.42000000000022 | 17.771 | 0.141 | 0.002 |
| -3.41600000000022 | 17.789 | 0.142 | 0.002 |
| -3.41200000000022 | 17.807 | 0.142 | 0.002 |
| -3.40800000000022 | 17.825 | 0.143 | 0.002 |
| -3.40400000000022 | 17.843 | 0.143 | 0.003 |
| -3.40000000000022 | 17.86 | 0.144 | 0.003 |
| -3.39600000000022 | 17.878 | 0.145 | 0.003 |
| -3.39200000000022 | 17.896 | 0.145 | 0.003 |
| -3.38800000000022 | 17.914 | 0.146 | 0.003 |
| -3.38400000000022 | 17.932 | 0.146 | 0.003 |
| -3.38000000000022 | 17.949 | 0.147 | 0.003 |
| -3.37600000000022 | 17.967 | 0.148 | 0.003 |
| -3.37200000000022 | 17.985 | 0.148 | 0.003 |
| -3.36800000000022 | 18.003 | 0.149 | 0.003 |
| -3.36400000000022 | 18.02 | 0.149 | 0.003 |
| -3.36000000000022 | 18.038 | 0.15 | 0.003 |
| -3.35600000000022 | 18.056 | 0.151 | 0.003 |
| -3.35200000000022 | 18.073 | 0.151 | 0.003 |
| -3.34800000000022 | 18.091 | 0.152 | 0.003 |
| -3.34400000000022 | 18.109 | 0.153 | 0.003 |
| -3.34000000000022 | 18.126 | 0.153 | 0.003 |
| -3.33600000000022 | 18.144 | 0.154 | 0.003 |
| -3.33200000000022 | 18.162 | 0.154 | 0.003 |
| -3.32800000000022 | 18.179 | 0.155 | 0.003 |
| -3.32400000000022 | 18.197 | 0.156 | 0.003 |
| -3.32000000000022 | 18.215 | 0.156 | 0.003 |
| -3.31600000000022 | 18.232 | 0.157 | 0.003 |
| -3.31200000000022 | 18.25 | 0.158 | 0.003 |
| -3.30800000000022 | 18.267 | 0.158 | 0.003 |
| -3.30400000000022 | 18.285 | 0.159 | 0.003 |
| -3.30000000000022 | 18.302 | 0.16 | 0.003 |
| -3.29600000000022 | 18.32 | 0.16 | 0.003 |
| -3.29200000000022 | 18.337 | 0.161 | 0.003 |
| -3.28800000000022 | 18.355 | 0.161 | 0.003 |
| -3.28400000000022 | 18.372 | 0.162 | 0.003 |
| -3.28000000000022 | 18.389 | 0.163 | 0.003 |
| -3.27600000000022 | 18.407 | 0.163 | 0.003 |
| -3.27200000000022 | 18.424 | 0.164 | 0.003 |
| -3.26800000000022 | 18.442 | 0.165 | 0.003 |
| -3.26400000000022 | 18.459 | 0.165 | 0.003 |
| -3.26000000000022 | 18.476 | 0.166 | 0.003 |
| -3.25600000000022 | 18.494 | 0.167 | 0.003 |
| -3.25200000000022 | 18.511 | 0.167 | 0.003 |
| -3.24800000000022 | 18.528 | 0.168 | 0.003 |
| -3.24400000000022 | 18.546 | 0.169 | 0.003 |
| -3.24000000000022 | 18.563 | 0.169 | 0.003 |
| -3.23600000000022 | 18.58 | 0.17 | 0.003 |
| -3.23200000000022 | 18.597 | 0.171 | 0.004 |
| -3.22800000000022 | 18.615 | 0.171 | 0.004 |
| -3.22400000000022 | 18.632 | 0.172 | 0.004 |
| -3.22000000000022 | 18.649 | 0.173 | 0.004 |
| -3.21600000000022 | 18.666 | 0.174 | 0.004 |
| -3.21200000000022 | 18.683 | 0.174 | 0.004 |
| -3.20800000000022 | 18.7 | 0.175 | 0.004 |
| -3.20400000000022 | 18.718 | 0.176 | 0.004 |
| -3.20000000000022 | 18.735 | 0.176 | 0.004 |
| -3.19600000000022 | 18.752 | 0.177 | 0.004 |
| -3.19200000000022 | 18.769 | 0.178 | 0.004 |
| -3.18800000000022 | 18.786 | 0.178 | 0.004 |
| -3.18400000000022 | 18.803 | 0.179 | 0.004 |
| -3.18000000000022 | 18.82 | 0.18 | 0.004 |
| -3.17600000000022 | 18.837 | 0.181 | 0.004 |
| -3.17200000000022 | 18.854 | 0.181 | 0.004 |
| -3.16800000000022 | 18.871 | 0.182 | 0.004 |
| -3.16400000000022 | 18.888 | 0.183 | 0.004 |
| -3.16000000000022 | 18.905 | 0.183 | 0.004 |
| -3.15600000000022 | 18.922 | 0.184 | 0.004 |
| -3.152000000000219 | 18.939 | 0.185 | 0.004 |
| -3.148000000000219 | 18.955 | 0.186 | 0.004 |
| -3.144000000000219 | 18.972 | 0.186 | 0.004 |
| -3.140000000000219 | 18.989 | 0.187 | 0.004 |
| -3.136000000000219 | 19.006 | 0.188 | 0.004 |
| -3.132000000000219 | 19.023 | 0.188 | 0.004 |
| -3.128000000000219 | 19.04 | 0.189 | 0.004 |
| -3.124000000000219 | 19.056 | 0.19 | 0.004 |
| -3.120000000000219 | 19.073 | 0.191 | 0.004 |
| -3.116000000000219 | 19.09 | 0.191 | 0.004 |
| -3.112000000000219 | 19.107 | 0.192 | 0.004 |
| -3.108000000000219 | 19.123 | 0.193 | 0.004 |
| -3.104000000000219 | 19.14 | 0.194 | 0.004 |
| -3.100000000000219 | 19.157 | 0.194 | 0.005 |
| -3.096000000000219 | 19.173 | 0.195 | 0.005 |
| -3.092000000000219 | 19.19 | 0.196 | 0.005 |
| -3.088000000000219 | 19.206 | 0.197 | 0.005 |
| -3.084000000000219 | 19.223 | 0.197 | 0.005 |
| -3.080000000000219 | 19.24 | 0.198 | 0.005 |
| -3.076000000000219 | 19.256 | 0.199 | 0.005 |
| -3.072000000000219 | 19.273 | 0.2 | 0.005 |
| -3.068000000000219 | 19.289 | 0.2 | 0.005 |
| -3.064000000000219 | 19.306 | 0.201 | 0.005 |
| -3.060000000000219 | 19.322 | 0.202 | 0.005 |
| -3.056000000000219 | 19.338 | 0.203 | 0.005 |
| -3.052000000000219 | 19.355 | 0.204 | 0.005 |
| -3.048000000000219 | 19.371 | 0.204 | 0.005 |
| -3.044000000000219 | 19.388 | 0.205 | 0.005 |
| -3.040000000000219 | 19.404 | 0.206 | 0.005 |
| -3.036000000000219 | 19.42 | 0.207 | 0.005 |
| -3.032000000000219 | 19.437 | 0.207 | 0.005 |
| -3.028000000000219 | 19.453 | 0.208 | 0.005 |
| -3.024000000000219 | 19.469 | 0.209 | 0.005 |
| -3.020000000000219 | 19.485 | 0.21 | 0.005 |
| -3.016000000000219 | 19.502 | 0.211 | 0.005 |
| -3.012000000000219 | 19.518 | 0.211 | 0.005 |
| -3.008000000000219 | 19.534 | 0.212 | 0.005 |
| -3.004000000000219 | 19.55 | 0.213 | 0.005 |
| -3.000000000000219 | 19.566 | 0.214 | 0.005 |
| -2.996000000000219 | 19.582 | 0.215 | 0.005 |
| -2.992000000000219 | 19.599 | 0.215 | 0.006 |
| -2.988000000000219 | 19.615 | 0.216 | 0.006 |
| -2.984000000000219 | 19.631 | 0.217 | 0.006 |
| -2.980000000000219 | 19.647 | 0.218 | 0.006 |
| -2.976000000000219 | 19.663 | 0.219 | 0.006 |
| -2.972000000000219 | 19.679 | 0.219 | 0.006 |
| -2.968000000000219 | 19.695 | 0.22 | 0.006 |
| -2.964000000000219 | 19.711 | 0.221 | 0.006 |
| -2.960000000000219 | 19.727 | 0.222 | 0.006 |
| -2.956000000000219 | 19.742 | 0.223 | 0.006 |
| -2.952000000000219 | 19.758 | 0.224 | 0.006 |
| -2.948000000000219 | 19.774 | 0.224 | 0.006 |
| -2.944000000000219 | 19.79 | 0.225 | 0.006 |
| -2.940000000000219 | 19.806 | 0.226 | 0.006 |
| -2.936000000000219 | 19.822 | 0.227 | 0.006 |
| -2.932000000000219 | 19.837 | 0.228 | 0.006 |
| -2.928000000000219 | 19.853 | 0.229 | 0.006 |
| -2.924000000000219 | 19.869 | 0.229 | 0.006 |
| -2.920000000000219 | 19.885 | 0.23 | 0.006 |
| -2.916000000000219 | 19.9 | 0.231 | 0.006 |
| -2.912000000000219 | 19.916 | 0.232 | 0.006 |
| -2.908000000000219 | 19.931 | 0.233 | 0.006 |
| -2.904000000000219 | 19.947 | 0.234 | 0.006 |
| -2.900000000000219 | 19.963 | 0.235 | 0.007 |
| -2.896000000000219 | 19.978 | 0.235 | 0.007 |
| -2.892000000000219 | 19.994 | 0.236 | 0.007 |
| -2.888000000000219 | 20.009 | 0.237 | 0.007 |
| -2.884000000000219 | 20.025 | 0.238 | 0.007 |
| -2.880000000000219 | 20.04 | 0.239 | 0.007 |
| -2.876000000000219 | 20.056 | 0.24 | 0.007 |
| -2.872000000000219 | 20.071 | 0.241 | 0.007 |
| -2.868000000000219 | 20.086 | 0.241 | 0.007 |
| -2.864000000000219 | 20.102 | 0.242 | 0.007 |
| -2.860000000000219 | 20.117 | 0.243 | 0.007 |
| -2.856000000000219 | 20.132 | 0.244 | 0.007 |
| -2.852000000000219 | 20.148 | 0.245 | 0.007 |
| -2.848000000000219 | 20.163 | 0.246 | 0.007 |
| -2.844000000000219 | 20.178 | 0.247 | 0.007 |
| -2.840000000000219 | 20.193 | 0.248 | 0.007 |
| -2.836000000000219 | 20.209 | 0.249 | 0.007 |
| -2.832000000000219 | 20.224 | 0.249 | 0.007 |
| -2.828000000000219 | 20.239 | 0.25 | 0.007 |
| -2.824000000000219 | 20.254 | 0.251 | 0.007 |
| -2.820000000000219 | 20.269 | 0.252 | 0.008 |
| -2.816000000000219 | 20.284 | 0.253 | 0.008 |
| -2.812000000000219 | 20.299 | 0.254 | 0.008 |
| -2.808000000000219 | 20.314 | 0.255 | 0.008 |
| -2.804000000000219 | 20.329 | 0.256 | 0.008 |
| -2.800000000000219 | 20.344 | 0.257 | 0.008 |
| -2.796000000000219 | 20.359 | 0.258 | 0.008 |
| -2.792000000000219 | 20.374 | 0.258 | 0.008 |
| -2.78800000000022 | 20.389 | 0.259 | 0.008 |
| -2.78400000000022 | 20.404 | 0.26 | 0.008 |
| -2.78000000000022 | 20.419 | 0.261 | 0.008 |
| -2.776000000000219 | 20.433 | 0.262 | 0.008 |
| -2.772000000000219 | 20.448 | 0.263 | 0.008 |
| -2.76800000000022 | 20.463 | 0.264 | 0.008 |
| -2.76400000000022 | 20.478 | 0.265 | 0.008 |
| -2.76000000000022 | 20.492 | 0.266 | 0.008 |
| -2.756000000000219 | 20.507 | 0.267 | 0.008 |
| -2.752000000000219 | 20.522 | 0.268 | 0.008 |
| -2.74800000000022 | 20.536 | 0.269 | 0.009 |
| -2.74400000000022 | 20.551 | 0.27 | 0.009 |
| -2.74000000000022 | 20.566 | 0.27 | 0.009 |
| -2.736000000000219 | 20.58 | 0.271 | 0.009 |
| -2.732000000000219 | 20.595 | 0.272 | 0.009 |
| -2.72800000000022 | 20.609 | 0.273 | 0.009 |
| -2.72400000000022 | 20.624 | 0.274 | 0.009 |
| -2.72000000000022 | 20.638 | 0.275 | 0.009 |
| -2.716000000000219 | 20.652 | 0.276 | 0.009 |
| -2.712000000000219 | 20.667 | 0.277 | 0.009 |
| -2.70800000000022 | 20.681 | 0.278 | 0.009 |
| -2.70400000000022 | 20.695 | 0.279 | 0.009 |
| -2.70000000000022 | 20.71 | 0.28 | 0.009 |
| -2.696000000000219 | 20.724 | 0.281 | 0.009 |
| -2.692000000000219 | 20.738 | 0.282 | 0.009 |
| -2.688000000000219 | 20.753 | 0.283 | 0.009 |
| -2.684000000000219 | 20.767 | 0.284 | 0.01 |
| -2.680000000000219 | 20.781 | 0.285 | 0.01 |
| -2.676000000000219 | 20.795 | 0.286 | 0.01 |
| -2.672000000000219 | 20.809 | 0.287 | 0.01 |
| -2.668000000000219 | 20.823 | 0.288 | 0.01 |
| -2.664000000000219 | 20.837 | 0.289 | 0.01 |
| -2.660000000000219 | 20.851 | 0.29 | 0.01 |
| -2.656000000000219 | 20.865 | 0.291 | 0.01 |
| -2.652000000000219 | 20.879 | 0.292 | 0.01 |
| -2.648000000000219 | 20.893 | 0.293 | 0.01 |
| -2.644000000000219 | 20.907 | 0.294 | 0.01 |
| -2.640000000000219 | 20.921 | 0.295 | 0.01 |
| -2.636000000000219 | 20.935 | 0.296 | 0.01 |
| -2.632000000000219 | 20.949 | 0.297 | 0.01 |
| -2.628000000000219 | 20.962 | 0.298 | 0.011 |
| -2.624000000000219 | 20.976 | 0.299 | 0.011 |
| -2.620000000000219 | 20.99 | 0.3 | 0.011 |
| -2.616000000000219 | 21.004 | 0.301 | 0.011 |
| -2.612000000000219 | 21.017 | 0.302 | 0.011 |
| -2.608000000000219 | 21.031 | 0.303 | 0.011 |
| -2.604000000000219 | 21.045 | 0.304 | 0.011 |
| -2.600000000000219 | 21.058 | 0.305 | 0.011 |
| -2.596000000000219 | 21.072 | 0.306 | 0.011 |
| -2.592000000000219 | 21.085 | 0.307 | 0.011 |
| -2.588000000000219 | 21.099 | 0.308 | 0.011 |
| -2.584000000000219 | 21.112 | 0.309 | 0.011 |
| -2.580000000000219 | 21.126 | 0.31 | 0.011 |
| -2.576000000000219 | 21.139 | 0.311 | 0.011 |
| -2.572000000000219 | 21.152 | 0.312 | 0.012 |
| -2.568000000000219 | 21.166 | 0.313 | 0.012 |
| -2.564000000000219 | 21.179 | 0.314 | 0.012 |
| -2.560000000000219 | 21.192 | 0.315 | 0.012 |
| -2.556000000000219 | 21.206 | 0.316 | 0.012 |
| -2.552000000000219 | 21.219 | 0.317 | 0.012 |
| -2.548000000000219 | 21.232 | 0.318 | 0.012 |
| -2.544000000000219 | 21.245 | 0.319 | 0.012 |
| -2.540000000000219 | 21.258 | 0.32 | 0.012 |
| -2.536000000000219 | 21.272 | 0.321 | 0.012 |
| -2.532000000000219 | 21.285 | 0.322 | 0.012 |
| -2.528000000000219 | 21.298 | 0.323 | 0.012 |
| -2.524000000000219 | 21.311 | 0.324 | 0.013 |
| -2.520000000000219 | 21.324 | 0.325 | 0.013 |
| -2.516000000000219 | 21.337 | 0.326 | 0.013 |
| -2.512000000000219 | 21.35 | 0.327 | 0.013 |
| -2.508000000000219 | 21.363 | 0.328 | 0.013 |
| -2.504000000000219 | 21.375 | 0.329 | 0.013 |
| -2.500000000000219 | 21.388 | 0.33 | 0.013 |
| -2.496000000000219 | 21.401 | 0.331 | 0.013 |
| -2.492000000000219 | 21.414 | 0.332 | 0.013 |
| -2.488000000000219 | 21.427 | 0.334 | 0.013 |
| -2.484000000000219 | 21.439 | 0.335 | 0.013 |
| -2.480000000000219 | 21.452 | 0.336 | 0.013 |
| -2.476000000000219 | 21.465 | 0.337 | 0.014 |
| -2.472000000000219 | 21.477 | 0.338 | 0.014 |
| -2.468000000000219 | 21.49 | 0.339 | 0.014 |
| -2.464000000000219 | 21.502 | 0.34 | 0.014 |
| -2.460000000000219 | 21.515 | 0.341 | 0.014 |
| -2.456000000000219 | 21.527 | 0.342 | 0.014 |
| -2.452000000000219 | 21.54 | 0.343 | 0.014 |
| -2.448000000000219 | 21.552 | 0.344 | 0.014 |
| -2.444000000000219 | 21.565 | 0.345 | 0.014 |
| -2.440000000000219 | 21.577 | 0.346 | 0.014 |
| -2.436000000000219 | 21.59 | 0.347 | 0.014 |
| -2.432000000000219 | 21.602 | 0.349 | 0.015 |
| -2.428000000000219 | 21.614 | 0.35 | 0.015 |
| -2.424000000000219 | 21.626 | 0.351 | 0.015 |
| -2.420000000000219 | 21.639 | 0.352 | 0.015 |
| -2.416000000000219 | 21.651 | 0.353 | 0.015 |
| -2.412000000000219 | 21.663 | 0.354 | 0.015 |
| -2.408000000000219 | 21.675 | 0.355 | 0.015 |
| -2.404000000000219 | 21.687 | 0.356 | 0.015 |
| -2.400000000000219 | 21.699 | 0.357 | 0.015 |
| -2.396000000000219 | 21.711 | 0.358 | 0.015 |
| -2.392000000000219 | 21.723 | 0.359 | 0.016 |
| -2.388000000000219 | 21.735 | 0.36 | 0.016 |
| -2.384000000000219 | 21.747 | 0.362 | 0.016 |
| -2.380000000000219 | 21.759 | 0.363 | 0.016 |
| -2.376000000000219 | 21.771 | 0.364 | 0.016 |
| -2.372000000000219 | 21.783 | 0.365 | 0.016 |
| -2.368000000000219 | 21.794 | 0.366 | 0.016 |
| -2.364000000000219 | 21.806 | 0.367 | 0.016 |
| -2.360000000000219 | 21.818 | 0.368 | 0.016 |
| -2.356000000000219 | 21.83 | 0.369 | 0.016 |
| -2.352000000000219 | 21.841 | 0.37 | 0.017 |
| -2.348000000000219 | 21.853 | 0.372 | 0.017 |
| -2.344000000000219 | 21.865 | 0.373 | 0.017 |
| -2.340000000000219 | 21.876 | 0.374 | 0.017 |
| -2.336000000000219 | 21.888 | 0.375 | 0.017 |
| -2.332000000000219 | 21.899 | 0.376 | 0.017 |
| -2.328000000000219 | 21.911 | 0.377 | 0.017 |
| -2.324000000000219 | 21.922 | 0.378 | 0.017 |
| -2.320000000000219 | 21.933 | 0.379 | 0.017 |
| -2.316000000000219 | 21.945 | 0.38 | 0.018 |
| -2.312000000000219 | 21.956 | 0.382 | 0.018 |
| -2.308000000000219 | 21.967 | 0.383 | 0.018 |
| -2.304000000000219 | 21.979 | 0.384 | 0.018 |
| -2.300000000000219 | 21.99 | 0.385 | 0.018 |
| -2.296000000000219 | 22.001 | 0.386 | 0.018 |
| -2.292000000000219 | 22.012 | 0.387 | 0.018 |
| -2.288000000000219 | 22.024 | 0.388 | 0.018 |
| -2.284000000000219 | 22.035 | 0.389 | 0.018 |
| -2.280000000000219 | 22.046 | 0.391 | 0.019 |
| -2.276000000000219 | 22.057 | 0.392 | 0.019 |
| -2.272000000000219 | 22.068 | 0.393 | 0.019 |
| -2.268000000000219 | 22.079 | 0.394 | 0.019 |
| -2.264000000000219 | 22.09 | 0.395 | 0.019 |
| -2.260000000000219 | 22.101 | 0.396 | 0.019 |
| -2.256000000000219 | 22.111 | 0.397 | 0.019 |
| -2.252000000000219 | 22.122 | 0.399 | 0.019 |
| -2.248000000000219 | 22.133 | 0.4 | 0.02 |
| -2.244000000000219 | 22.144 | 0.401 | 0.02 |
| -2.240000000000219 | 22.155 | 0.402 | 0.02 |
| -2.236000000000219 | 22.165 | 0.403 | 0.02 |
| -2.232000000000219 | 22.176 | 0.404 | 0.02 |
| -2.228000000000219 | 22.187 | 0.405 | 0.02 |
| -2.224000000000219 | 22.197 | 0.407 | 0.02 |
| -2.220000000000219 | 22.208 | 0.408 | 0.02 |
| -2.216000000000219 | 22.218 | 0.409 | 0.021 |
| -2.212000000000219 | 22.229 | 0.41 | 0.021 |
| -2.208000000000219 | 22.239 | 0.411 | 0.021 |
| -2.204000000000219 | 22.25 | 0.412 | 0.021 |
| -2.200000000000219 | 22.26 | 0.413 | 0.021 |
| -2.196000000000219 | 22.27 | 0.415 | 0.021 |
| -2.192000000000219 | 22.281 | 0.416 | 0.021 |
| -2.188000000000219 | 22.291 | 0.417 | 0.021 |
| -2.184000000000219 | 22.301 | 0.418 | 0.022 |
| -2.180000000000219 | 22.312 | 0.419 | 0.022 |
| -2.176000000000219 | 22.322 | 0.42 | 0.022 |
| -2.172000000000219 | 22.332 | 0.421 | 0.022 |
| -2.168000000000219 | 22.342 | 0.423 | 0.022 |
| -2.164000000000219 | 22.352 | 0.424 | 0.022 |
| -2.160000000000219 | 22.362 | 0.425 | 0.022 |
| -2.156000000000219 | 22.372 | 0.426 | 0.022 |
| -2.152000000000219 | 22.382 | 0.427 | 0.023 |
| -2.148000000000219 | 22.392 | 0.428 | 0.023 |
| -2.144000000000219 | 22.402 | 0.43 | 0.023 |
| -2.140000000000219 | 22.412 | 0.431 | 0.023 |
| -2.136000000000219 | 22.422 | 0.432 | 0.023 |
| -2.132000000000219 | 22.432 | 0.433 | 0.023 |
| -2.128000000000219 | 22.441 | 0.434 | 0.023 |
| -2.124000000000219 | 22.451 | 0.435 | 0.024 |
| -2.120000000000219 | 22.461 | 0.437 | 0.024 |
| -2.116000000000219 | 22.471 | 0.438 | 0.024 |
| -2.112000000000219 | 22.48 | 0.439 | 0.024 |
| -2.108000000000219 | 22.49 | 0.44 | 0.024 |
| -2.104000000000219 | 22.499 | 0.441 | 0.024 |
| -2.100000000000219 | 22.509 | 0.442 | 0.024 |
| -2.096000000000219 | 22.518 | 0.444 | 0.025 |
| -2.092000000000219 | 22.528 | 0.445 | 0.025 |
| -2.088000000000219 | 22.537 | 0.446 | 0.025 |
| -2.084000000000219 | 22.547 | 0.447 | 0.025 |
| -2.080000000000219 | 22.556 | 0.448 | 0.025 |
| -2.076000000000219 | 22.566 | 0.449 | 0.025 |
| -2.072000000000219 | 22.575 | 0.451 | 0.025 |
| -2.068000000000219 | 22.584 | 0.452 | 0.026 |
| -2.064000000000219 | 22.593 | 0.453 | 0.026 |
| -2.060000000000219 | 22.603 | 0.454 | 0.026 |
| -2.056000000000219 | 22.612 | 0.455 | 0.026 |
| -2.052000000000219 | 22.621 | 0.456 | 0.026 |
| -2.048000000000219 | 22.63 | 0.458 | 0.026 |
| -2.044000000000219 | 22.639 | 0.459 | 0.026 |
| -2.040000000000219 | 22.648 | 0.46 | 0.027 |
| -2.036000000000219 | 22.657 | 0.461 | 0.027 |
| -2.032000000000219 | 22.666 | 0.462 | 0.027 |
| -2.028000000000219 | 22.675 | 0.463 | 0.027 |
| -2.024000000000219 | 22.684 | 0.465 | 0.027 |
| -2.020000000000219 | 22.693 | 0.466 | 0.027 |
| -2.016000000000219 | 22.701 | 0.467 | 0.028 |
| -2.012000000000219 | 22.71 | 0.468 | 0.028 |
| -2.008000000000218 | 22.719 | 0.469 | 0.028 |
| -2.004000000000218 | 22.728 | 0.47 | 0.028 |
| -2.000000000000218 | 22.736 | 0.472 | 0.028 |
| -1.996000000000218 | 22.745 | 0.473 | 0.028 |
| -1.992000000000218 | 22.754 | 0.474 | 0.028 |
| -1.988000000000218 | 22.762 | 0.475 | 0.029 |
| -1.984000000000218 | 22.771 | 0.476 | 0.029 |
| -1.980000000000218 | 22.779 | 0.477 | 0.029 |
| -1.976000000000218 | 22.788 | 0.479 | 0.029 |
| -1.972000000000218 | 22.796 | 0.48 | 0.029 |
| -1.968000000000218 | 22.805 | 0.481 | 0.029 |
| -1.964000000000218 | 22.813 | 0.482 | 0.03 |
| -1.960000000000218 | 22.821 | 0.483 | 0.03 |
| -1.956000000000218 | 22.83 | 0.485 | 0.03 |
| -1.952000000000218 | 22.838 | 0.486 | 0.03 |
| -1.948000000000218 | 22.846 | 0.487 | 0.03 |
| -1.944000000000218 | 22.854 | 0.488 | 0.03 |
| -1.940000000000218 | 22.862 | 0.489 | 0.031 |
| -1.936000000000218 | 22.87 | 0.49 | 0.031 |
| -1.932000000000218 | 22.879 | 0.492 | 0.031 |
| -1.928000000000218 | 22.887 | 0.493 | 0.031 |
| -1.924000000000218 | 22.895 | 0.494 | 0.031 |
| -1.920000000000218 | 22.903 | 0.495 | 0.031 |
| -1.916000000000218 | 22.911 | 0.496 | 0.032 |
| -1.912000000000218 | 22.919 | 0.497 | 0.032 |
| -1.908000000000218 | 22.926 | 0.499 | 0.032 |
| -1.904000000000218 | 22.934 | 0.5 | 0.032 |
| -1.900000000000218 | 22.942 | 0.501 | 0.032 |
| -1.896000000000218 | 22.95 | 0.502 | 0.032 |
| -1.892000000000218 | 22.958 | 0.503 | 0.033 |
| -1.888000000000218 | 22.965 | 0.504 | 0.033 |
| -1.884000000000218 | 22.973 | 0.506 | 0.033 |
| -1.880000000000218 | 22.981 | 0.507 | 0.033 |
| -1.876000000000218 | 22.988 | 0.508 | 0.033 |
| -1.872000000000218 | 22.996 | 0.509 | 0.034 |
| -1.868000000000218 | 23.003 | 0.51 | 0.034 |
| -1.864000000000218 | 23.011 | 0.511 | 0.034 |
| -1.860000000000218 | 23.018 | 0.513 | 0.034 |
| -1.856000000000218 | 23.026 | 0.514 | 0.034 |
| -1.852000000000218 | 23.033 | 0.515 | 0.034 |
| -1.848000000000218 | 23.04 | 0.516 | 0.035 |
| -1.844000000000218 | 23.048 | 0.517 | 0.035 |
| -1.840000000000218 | 23.055 | 0.518 | 0.035 |
| -1.836000000000218 | 23.062 | 0.519 | 0.035 |
| -1.832000000000218 | 23.07 | 0.521 | 0.035 |
| -1.828000000000218 | 23.077 | 0.522 | 0.036 |
| -1.824000000000218 | 23.084 | 0.523 | 0.036 |
| -1.820000000000218 | 23.091 | 0.524 | 0.036 |
| -1.816000000000218 | 23.098 | 0.525 | 0.036 |
| -1.812000000000218 | 23.105 | 0.526 | 0.036 |
| -1.808000000000218 | 23.112 | 0.528 | 0.036 |
| -1.804000000000218 | 23.119 | 0.529 | 0.037 |
| -1.800000000000218 | 23.126 | 0.53 | 0.037 |
| -1.796000000000218 | 23.133 | 0.531 | 0.037 |
| -1.792000000000218 | 23.14 | 0.532 | 0.037 |
| -1.788000000000218 | 23.147 | 0.533 | 0.037 |
| -1.784000000000218 | 23.154 | 0.534 | 0.038 |
| -1.780000000000218 | 23.161 | 0.536 | 0.038 |
| -1.776000000000218 | 23.167 | 0.537 | 0.038 |
| -1.772000000000218 | 23.174 | 0.538 | 0.038 |
| -1.768000000000218 | 23.181 | 0.539 | 0.038 |
| -1.764000000000218 | 23.187 | 0.54 | 0.039 |
| -1.760000000000218 | 23.194 | 0.541 | 0.039 |
| -1.756000000000218 | 23.201 | 0.542 | 0.039 |
| -1.752000000000218 | 23.207 | 0.544 | 0.039 |
| -1.748000000000218 | 23.214 | 0.545 | 0.039 |
| -1.744000000000218 | 23.22 | 0.546 | 0.04 |
| -1.740000000000218 | 23.227 | 0.547 | 0.04 |
| -1.736000000000218 | 23.233 | 0.548 | 0.04 |
| -1.732000000000218 | 23.239 | 0.549 | 0.04 |
| -1.728000000000218 | 23.246 | 0.55 | 0.04 |
| -1.724000000000218 | 23.252 | 0.551 | 0.041 |
| -1.720000000000218 | 23.258 | 0.553 | 0.041 |
| -1.716000000000218 | 23.265 | 0.554 | 0.041 |
| -1.712000000000218 | 23.271 | 0.555 | 0.041 |
| -1.708000000000218 | 23.277 | 0.556 | 0.041 |
| -1.704000000000218 | 23.283 | 0.557 | 0.042 |
| -1.700000000000218 | 23.289 | 0.558 | 0.042 |
| -1.696000000000218 | 23.295 | 0.559 | 0.042 |
| -1.692000000000218 | 23.301 | 0.56 | 0.042 |
| -1.688000000000218 | 23.307 | 0.561 | 0.042 |
| -1.684000000000218 | 23.313 | 0.563 | 0.043 |
| -1.680000000000218 | 23.319 | 0.564 | 0.043 |
| -1.676000000000218 | 23.325 | 0.565 | 0.043 |
| -1.672000000000218 | 23.331 | 0.566 | 0.043 |
| -1.668000000000218 | 23.337 | 0.567 | 0.043 |
| -1.664000000000218 | 23.343 | 0.568 | 0.044 |
| -1.660000000000218 | 23.349 | 0.569 | 0.044 |
| -1.656000000000218 | 23.354 | 0.57 | 0.044 |
| -1.652000000000218 | 23.36 | 0.571 | 0.044 |
| -1.648000000000218 | 23.366 | 0.572 | 0.044 |
| -1.644000000000218 | 23.371 | 0.574 | 0.045 |
| -1.640000000000218 | 23.377 | 0.575 | 0.045 |
| -1.636000000000218 | 23.383 | 0.576 | 0.045 |
| -1.632000000000218 | 23.388 | 0.577 | 0.045 |
| -1.628000000000218 | 23.394 | 0.578 | 0.046 |
| -1.624000000000218 | 23.399 | 0.579 | 0.046 |
| -1.620000000000218 | 23.405 | 0.58 | 0.046 |
| -1.616000000000218 | 23.41 | 0.581 | 0.046 |
| -1.612000000000218 | 23.416 | 0.582 | 0.046 |
| -1.608000000000218 | 23.421 | 0.583 | 0.047 |
| -1.604000000000218 | 23.426 | 0.584 | 0.047 |
| -1.600000000000218 | 23.432 | 0.585 | 0.047 |
| -1.596000000000218 | 23.437 | 0.587 | 0.047 |
| -1.592000000000218 | 23.442 | 0.588 | 0.047 |
| -1.588000000000218 | 23.447 | 0.589 | 0.048 |
| -1.584000000000218 | 23.453 | 0.59 | 0.048 |
| -1.580000000000218 | 23.458 | 0.591 | 0.048 |
| -1.576000000000218 | 23.463 | 0.592 | 0.048 |
| -1.572000000000218 | 23.468 | 0.593 | 0.049 |
| -1.568000000000218 | 23.473 | 0.594 | 0.049 |
| -1.564000000000218 | 23.478 | 0.595 | 0.049 |
| -1.560000000000218 | 23.483 | 0.596 | 0.049 |
| -1.556000000000218 | 23.488 | 0.597 | 0.049 |
| -1.552000000000218 | 23.493 | 0.598 | 0.05 |
| -1.548000000000218 | 23.498 | 0.599 | 0.05 |
| -1.544000000000218 | 23.503 | 0.6 | 0.05 |
| -1.540000000000218 | 23.507 | 0.601 | 0.05 |
| -1.536000000000218 | 23.512 | 0.602 | 0.051 |
| -1.532000000000218 | 23.517 | 0.603 | 0.051 |
| -1.528000000000218 | 23.522 | 0.604 | 0.051 |
| -1.524000000000218 | 23.527 | 0.605 | 0.051 |
| -1.520000000000218 | 23.531 | 0.606 | 0.051 |
| -1.516000000000218 | 23.536 | 0.607 | 0.052 |
| -1.512000000000218 | 23.54 | 0.608 | 0.052 |
| -1.508000000000218 | 23.545 | 0.609 | 0.052 |
| -1.504000000000218 | 23.55 | 0.61 | 0.052 |
| -1.500000000000218 | 23.554 | 0.611 | 0.053 |
| -1.496000000000218 | 23.559 | 0.612 | 0.053 |
| -1.492000000000218 | 23.563 | 0.613 | 0.053 |
| -1.488000000000218 | 23.568 | 0.614 | 0.053 |
| -1.484000000000218 | 23.572 | 0.615 | 0.053 |
| -1.480000000000218 | 23.576 | 0.616 | 0.054 |
| -1.476000000000218 | 23.581 | 0.617 | 0.054 |
| -1.472000000000218 | 23.585 | 0.618 | 0.054 |
| -1.468000000000218 | 23.589 | 0.619 | 0.054 |
| -1.464000000000218 | 23.594 | 0.62 | 0.055 |
| -1.460000000000218 | 23.598 | 0.621 | 0.055 |
| -1.456000000000218 | 23.602 | 0.622 | 0.055 |
| -1.452000000000218 | 23.606 | 0.623 | 0.055 |
| -1.448000000000218 | 23.61 | 0.624 | 0.056 |
| -1.444000000000218 | 23.615 | 0.625 | 0.056 |
| -1.440000000000218 | 23.619 | 0.626 | 0.056 |
| -1.436000000000218 | 23.623 | 0.627 | 0.056 |
| -1.432000000000218 | 23.627 | 0.628 | 0.056 |
| -1.428000000000218 | 23.631 | 0.629 | 0.057 |
| -1.424000000000218 | 23.635 | 0.63 | 0.057 |
| -1.420000000000218 | 23.639 | 0.631 | 0.057 |
| -1.416000000000218 | 23.643 | 0.632 | 0.057 |
| -1.412000000000218 | 23.646 | 0.633 | 0.058 |
| -1.408000000000218 | 23.65 | 0.634 | 0.058 |
| -1.404000000000218 | 23.654 | 0.635 | 0.058 |
| -1.400000000000218 | 23.658 | 0.636 | 0.058 |
| -1.396000000000218 | 23.662 | 0.637 | 0.058 |
| -1.392000000000218 | 23.665 | 0.638 | 0.059 |
| -1.388000000000218 | 23.669 | 0.639 | 0.059 |
| -1.384000000000218 | 23.673 | 0.639 | 0.059 |
| -1.380000000000218 | 23.677 | 0.64 | 0.059 |
| -1.376000000000218 | 23.68 | 0.641 | 0.06 |
| -1.372000000000218 | 23.684 | 0.642 | 0.06 |
| -1.368000000000218 | 23.687 | 0.643 | 0.06 |
| -1.364000000000218 | 23.691 | 0.644 | 0.06 |
| -1.360000000000218 | 23.694 | 0.645 | 0.061 |
| -1.356000000000218 | 23.698 | 0.646 | 0.061 |
| -1.352000000000218 | 23.701 | 0.647 | 0.061 |
| -1.348000000000218 | 23.705 | 0.648 | 0.061 |
| -1.344000000000218 | 23.708 | 0.649 | 0.061 |
| -1.340000000000218 | 23.712 | 0.649 | 0.062 |
| -1.336000000000218 | 23.715 | 0.65 | 0.062 |
| -1.332000000000218 | 23.718 | 0.651 | 0.062 |
| -1.328000000000218 | 23.722 | 0.652 | 0.062 |
| -1.324000000000218 | 23.725 | 0.653 | 0.063 |
| -1.320000000000218 | 23.728 | 0.654 | 0.063 |
| -1.316000000000218 | 23.731 | 0.655 | 0.063 |
| -1.312000000000218 | 23.735 | 0.656 | 0.063 |
| -1.308000000000218 | 23.738 | 0.656 | 0.064 |
| -1.304000000000218 | 23.741 | 0.657 | 0.064 |
| -1.300000000000218 | 23.744 | 0.658 | 0.064 |
| -1.296000000000218 | 23.747 | 0.659 | 0.064 |
| -1.292000000000218 | 23.75 | 0.66 | 0.064 |
| -1.288000000000218 | 23.753 | 0.661 | 0.065 |
| -1.284000000000218 | 23.756 | 0.661 | 0.065 |
| -1.280000000000218 | 23.759 | 0.662 | 0.065 |
| -1.276000000000218 | 23.762 | 0.663 | 0.065 |
| -1.272000000000218 | 23.765 | 0.664 | 0.066 |
| -1.268000000000218 | 23.768 | 0.665 | 0.066 |
| -1.264000000000218 | 23.771 | 0.666 | 0.066 |
| -1.260000000000218 | 23.774 | 0.666 | 0.066 |
| -1.256000000000218 | 23.777 | 0.667 | 0.067 |
| -1.252000000000218 | 23.78 | 0.668 | 0.067 |
| -1.248000000000218 | 23.782 | 0.669 | 0.067 |
| -1.244000000000218 | 23.785 | 0.67 | 0.067 |
| -1.240000000000218 | 23.788 | 0.67 | 0.067 |
| -1.236000000000218 | 23.791 | 0.671 | 0.068 |
| -1.232000000000218 | 23.793 | 0.672 | 0.068 |
| -1.228000000000218 | 23.796 | 0.673 | 0.068 |
| -1.224000000000218 | 23.799 | 0.674 | 0.068 |
| -1.220000000000218 | 23.801 | 0.674 | 0.069 |
| -1.216000000000218 | 23.804 | 0.675 | 0.069 |
| -1.212000000000218 | 23.807 | 0.676 | 0.069 |
| -1.208000000000218 | 23.809 | 0.677 | 0.069 |
| -1.204000000000218 | 23.812 | 0.677 | 0.07 |
| -1.200000000000218 | 23.814 | 0.678 | 0.07 |
| -1.196000000000218 | 23.817 | 0.679 | 0.07 |
| -1.192000000000218 | 23.819 | 0.68 | 0.07 |
| -1.188000000000218 | 23.821 | 0.68 | 0.07 |
| -1.184000000000218 | 23.824 | 0.681 | 0.071 |
| -1.180000000000218 | 23.826 | 0.682 | 0.071 |
| -1.176000000000218 | 23.829 | 0.683 | 0.071 |
| -1.172000000000218 | 23.831 | 0.683 | 0.071 |
| -1.168000000000218 | 23.833 | 0.684 | 0.072 |
| -1.164000000000218 | 23.836 | 0.685 | 0.072 |
| -1.160000000000218 | 23.838 | 0.685 | 0.072 |
| -1.156000000000218 | 23.84 | 0.686 | 0.072 |
| -1.152000000000218 | 23.842 | 0.687 | 0.072 |
| -1.148000000000218 | 23.845 | 0.688 | 0.073 |
| -1.144000000000218 | 23.847 | 0.688 | 0.073 |
| -1.140000000000218 | 23.849 | 0.689 | 0.073 |
| -1.136000000000218 | 23.851 | 0.69 | 0.073 |
| -1.132000000000218 | 23.853 | 0.69 | 0.074 |
| -1.128000000000218 | 23.855 | 0.691 | 0.074 |
| -1.124000000000218 | 23.857 | 0.692 | 0.074 |
| -1.120000000000218 | 23.86 | 0.692 | 0.074 |
| -1.116000000000218 | 23.862 | 0.693 | 0.074 |
| -1.112000000000218 | 23.864 | 0.694 | 0.075 |
| -1.108000000000218 | 23.866 | 0.694 | 0.075 |
| -1.104000000000218 | 23.868 | 0.695 | 0.075 |
| -1.100000000000218 | 23.87 | 0.696 | 0.075 |
| -1.096000000000218 | 23.871 | 0.696 | 0.076 |
| -1.092000000000218 | 23.873 | 0.697 | 0.076 |
| -1.088000000000218 | 23.875 | 0.698 | 0.076 |
| -1.084000000000218 | 23.877 | 0.698 | 0.076 |
| -1.080000000000218 | 23.879 | 0.699 | 0.076 |
| -1.076000000000218 | 23.881 | 0.699 | 0.077 |
| -1.072000000000218 | 23.883 | 0.7 | 0.077 |
| -1.068000000000218 | 23.885 | 0.701 | 0.077 |
| -1.064000000000218 | 23.886 | 0.701 | 0.077 |
| -1.060000000000218 | 23.888 | 0.702 | 0.077 |
| -1.056000000000218 | 23.89 | 0.703 | 0.078 |
| -1.052000000000218 | 23.891 | 0.703 | 0.078 |
| -1.048000000000218 | 23.893 | 0.704 | 0.078 |
| -1.044000000000218 | 23.895 | 0.704 | 0.078 |
| -1.040000000000218 | 23.897 | 0.705 | 0.078 |
| -1.036000000000218 | 23.898 | 0.705 | 0.079 |
| -1.032000000000218 | 23.9 | 0.706 | 0.079 |
| -1.028000000000218 | 23.901 | 0.707 | 0.079 |
| -1.024000000000218 | 23.903 | 0.707 | 0.079 |
| -1.020000000000218 | 23.905 | 0.708 | 0.08 |
| -1.016000000000218 | 23.906 | 0.708 | 0.08 |
| -1.012000000000218 | 23.908 | 0.709 | 0.08 |
| -1.008000000000218 | 23.909 | 0.709 | 0.08 |
| -1.004000000000218 | 23.911 | 0.71 | 0.08 |
| -1.000000000000218 | 23.912 | 0.711 | 0.081 |
| -0.996000000000218 | 23.914 | 0.711 | 0.081 |
| -0.992000000000218 | 23.915 | 0.712 | 0.081 |
| -0.988000000000218 | 23.916 | 0.712 | 0.081 |
| -0.984000000000218 | 23.918 | 0.713 | 0.081 |
| -0.980000000000218 | 23.919 | 0.713 | 0.082 |
| -0.976000000000218 | 23.921 | 0.714 | 0.082 |
| -0.972000000000218 | 23.922 | 0.714 | 0.082 |
| -0.968000000000218 | 23.923 | 0.715 | 0.082 |
| -0.964000000000218 | 23.925 | 0.715 | 0.082 |
| -0.960000000000218 | 23.926 | 0.716 | 0.082 |
| -0.956000000000218 | 23.927 | 0.716 | 0.083 |
| -0.952000000000218 | 23.929 | 0.717 | 0.083 |
| -0.948000000000218 | 23.93 | 0.717 | 0.083 |
| -0.944000000000218 | 23.931 | 0.718 | 0.083 |
| -0.940000000000218 | 23.932 | 0.718 | 0.083 |
| -0.936000000000218 | 23.934 | 0.719 | 0.084 |
| -0.932000000000218 | 23.935 | 0.719 | 0.084 |
| -0.928000000000218 | 23.936 | 0.72 | 0.084 |
| -0.924000000000218 | 23.937 | 0.72 | 0.084 |
| -0.920000000000218 | 23.938 | 0.72 | 0.084 |
| -0.916000000000218 | 23.939 | 0.721 | 0.085 |
| -0.912000000000218 | 23.94 | 0.721 | 0.085 |
| -0.908000000000217 | 23.942 | 0.722 | 0.085 |
| -0.904000000000217 | 23.943 | 0.722 | 0.085 |
| -0.900000000000217 | 23.944 | 0.723 | 0.085 |
| -0.896000000000217 | 23.945 | 0.723 | 0.085 |
| -0.892000000000217 | 23.946 | 0.724 | 0.086 |
| -0.888000000000217 | 23.947 | 0.724 | 0.086 |
| -0.884000000000217 | 23.948 | 0.724 | 0.086 |
| -0.880000000000217 | 23.949 | 0.725 | 0.086 |
| -0.876000000000217 | 23.95 | 0.725 | 0.086 |
| -0.872000000000217 | 23.951 | 0.726 | 0.086 |
| -0.868000000000217 | 23.952 | 0.726 | 0.087 |
| -0.864000000000217 | 23.953 | 0.726 | 0.087 |
| -0.860000000000217 | 23.954 | 0.727 | 0.087 |
| -0.856000000000217 | 23.955 | 0.727 | 0.087 |
| -0.852000000000217 | 23.956 | 0.728 | 0.087 |
| -0.848000000000217 | 23.956 | 0.728 | 0.087 |
| -0.844000000000217 | 23.957 | 0.728 | 0.088 |
| -0.840000000000217 | 23.958 | 0.729 | 0.088 |
| -0.836000000000217 | 23.959 | 0.729 | 0.088 |
| -0.832000000000217 | 23.96 | 0.729 | 0.088 |
| -0.828000000000217 | 23.961 | 0.73 | 0.088 |
| -0.824000000000217 | 23.961 | 0.73 | 0.088 |
| -0.820000000000217 | 23.962 | 0.731 | 0.089 |
| -0.816000000000217 | 23.963 | 0.731 | 0.089 |
| -0.812000000000217 | 23.964 | 0.731 | 0.089 |
| -0.808000000000217 | 23.965 | 0.732 | 0.089 |
| -0.804000000000217 | 23.965 | 0.732 | 0.089 |
| -0.800000000000217 | 23.966 | 0.732 | 0.089 |
| -0.796000000000217 | 23.967 | 0.733 | 0.089 |
| -0.792000000000217 | 23.968 | 0.733 | 0.09 |
| -0.788000000000217 | 23.968 | 0.733 | 0.09 |
| -0.784000000000217 | 23.969 | 0.734 | 0.09 |
| -0.780000000000217 | 23.97 | 0.734 | 0.09 |
| -0.776000000000217 | 23.97 | 0.734 | 0.09 |
| -0.772000000000217 | 23.971 | 0.734 | 0.09 |
| -0.768000000000217 | 23.972 | 0.735 | 0.09 |
| -0.764000000000217 | 23.972 | 0.735 | 0.091 |
| -0.760000000000217 | 23.973 | 0.735 | 0.091 |
| -0.756000000000217 | 23.974 | 0.736 | 0.091 |
| -0.752000000000217 | 23.974 | 0.736 | 0.091 |
| -0.748000000000217 | 23.975 | 0.736 | 0.091 |
| -0.744000000000217 | 23.975 | 0.736 | 0.091 |
| -0.740000000000217 | 23.976 | 0.737 | 0.091 |
| -0.736000000000217 | 23.976 | 0.737 | 0.092 |
| -0.732000000000217 | 23.977 | 0.737 | 0.092 |
| -0.728000000000217 | 23.978 | 0.738 | 0.092 |
| -0.724000000000217 | 23.978 | 0.738 | 0.092 |
| -0.720000000000217 | 23.979 | 0.738 | 0.092 |
| -0.716000000000217 | 23.979 | 0.738 | 0.092 |
| -0.712000000000217 | 23.98 | 0.739 | 0.092 |
| -0.708000000000217 | 23.98 | 0.739 | 0.092 |
| -0.704000000000217 | 23.981 | 0.739 | 0.093 |
| -0.700000000000217 | 23.981 | 0.739 | 0.093 |
| -0.696000000000217 | 23.982 | 0.74 | 0.093 |
| -0.692000000000217 | 23.982 | 0.74 | 0.093 |
| -0.688000000000217 | 23.983 | 0.74 | 0.093 |
| -0.684000000000217 | 23.983 | 0.74 | 0.093 |
| -0.680000000000217 | 23.983 | 0.74 | 0.093 |
| -0.676000000000217 | 23.984 | 0.741 | 0.093 |
| -0.672000000000217 | 23.984 | 0.741 | 0.093 |
| -0.668000000000217 | 23.985 | 0.741 | 0.094 |
| -0.664000000000217 | 23.985 | 0.741 | 0.094 |
| -0.660000000000217 | 23.985 | 0.742 | 0.094 |
| -0.656000000000217 | 23.986 | 0.742 | 0.094 |
| -0.652000000000217 | 23.986 | 0.742 | 0.094 |
| -0.648000000000217 | 23.987 | 0.742 | 0.094 |
| -0.644000000000217 | 23.987 | 0.742 | 0.094 |
| -0.640000000000217 | 23.987 | 0.742 | 0.094 |
| -0.636000000000217 | 23.988 | 0.743 | 0.094 |
| -0.632000000000217 | 23.988 | 0.743 | 0.094 |
| -0.628000000000217 | 23.988 | 0.743 | 0.095 |
| -0.624000000000217 | 23.989 | 0.743 | 0.095 |
| -0.620000000000217 | 23.989 | 0.743 | 0.095 |
| -0.616000000000217 | 23.989 | 0.744 | 0.095 |
| -0.612000000000217 | 23.99 | 0.744 | 0.095 |
| -0.608000000000217 | 23.99 | 0.744 | 0.095 |
| -0.604000000000217 | 23.99 | 0.744 | 0.095 |
| -0.600000000000217 | 23.991 | 0.744 | 0.095 |
| -0.596000000000217 | 23.991 | 0.744 | 0.095 |
| -0.592000000000217 | 23.991 | 0.744 | 0.095 |
| -0.588000000000217 | 23.991 | 0.745 | 0.095 |
| -0.584000000000217 | 23.992 | 0.745 | 0.096 |
| -0.580000000000217 | 23.992 | 0.745 | 0.096 |
| -0.576000000000217 | 23.992 | 0.745 | 0.096 |
| -0.572000000000217 | 23.992 | 0.745 | 0.096 |
| -0.568000000000217 | 23.993 | 0.745 | 0.096 |
| -0.564000000000217 | 23.993 | 0.745 | 0.096 |
| -0.560000000000217 | 23.993 | 0.746 | 0.096 |
| -0.556000000000217 | 23.993 | 0.746 | 0.096 |
| -0.552000000000217 | 23.994 | 0.746 | 0.096 |
| -0.548000000000217 | 23.994 | 0.746 | 0.096 |
| -0.544000000000217 | 23.994 | 0.746 | 0.096 |
| -0.540000000000217 | 23.994 | 0.746 | 0.096 |
| -0.536000000000217 | 23.994 | 0.746 | 0.096 |
| -0.532000000000217 | 23.995 | 0.746 | 0.096 |
| -0.528000000000217 | 23.995 | 0.747 | 0.097 |
| -0.524000000000217 | 23.995 | 0.747 | 0.097 |
| -0.520000000000217 | 23.995 | 0.747 | 0.097 |
| -0.516000000000217 | 23.995 | 0.747 | 0.097 |
| -0.512000000000217 | 23.995 | 0.747 | 0.097 |
| -0.508000000000217 | 23.996 | 0.747 | 0.097 |
| -0.504000000000217 | 23.996 | 0.747 | 0.097 |
| -0.500000000000217 | 23.996 | 0.747 | 0.097 |
| -0.496000000000217 | 23.996 | 0.747 | 0.097 |
| -0.492000000000217 | 23.996 | 0.747 | 0.097 |
| -0.488000000000217 | 23.996 | 0.748 | 0.097 |
| -0.484000000000217 | 23.996 | 0.748 | 0.097 |
| -0.480000000000217 | 23.997 | 0.748 | 0.097 |
| -0.476000000000217 | 23.997 | 0.748 | 0.097 |
| -0.472000000000217 | 23.997 | 0.748 | 0.097 |
| -0.468000000000217 | 23.997 | 0.748 | 0.097 |
| -0.464000000000217 | 23.997 | 0.748 | 0.097 |
| -0.460000000000217 | 23.997 | 0.748 | 0.097 |
| -0.456000000000217 | 23.997 | 0.748 | 0.097 |
| -0.452000000000217 | 23.997 | 0.748 | 0.098 |
| -0.448000000000217 | 23.998 | 0.748 | 0.098 |
| -0.444000000000217 | 23.998 | 0.748 | 0.098 |
| -0.440000000000217 | 23.998 | 0.748 | 0.098 |
| -0.436000000000217 | 23.998 | 0.748 | 0.098 |
| -0.432000000000217 | 23.998 | 0.749 | 0.098 |
| -0.428000000000217 | 23.998 | 0.749 | 0.098 |
| -0.424000000000217 | 23.998 | 0.749 | 0.098 |
| -0.420000000000217 | 23.998 | 0.749 | 0.098 |
| -0.416000000000217 | 23.998 | 0.749 | 0.098 |
| -0.412000000000217 | 23.998 | 0.749 | 0.098 |
| -0.408000000000217 | 23.998 | 0.749 | 0.098 |
| -0.404000000000217 | 23.998 | 0.749 | 0.098 |
| -0.400000000000217 | 23.999 | 0.749 | 0.098 |
| -0.396000000000217 | 23.999 | 0.749 | 0.098 |
| -0.392000000000217 | 23.999 | 0.749 | 0.098 |
| -0.388000000000217 | 23.999 | 0.749 | 0.098 |
| -0.384000000000217 | 23.999 | 0.749 | 0.098 |
| -0.380000000000217 | 23.999 | 0.749 | 0.098 |
| -0.376000000000217 | 23.999 | 0.749 | 0.098 |
| -0.372000000000217 | 23.999 | 0.749 | 0.098 |
| -0.368000000000217 | 23.999 | 0.749 | 0.098 |
| -0.364000000000217 | 23.999 | 0.749 | 0.098 |
| -0.360000000000217 | 23.999 | 0.749 | 0.098 |
| -0.356000000000217 | 23.999 | 0.749 | 0.098 |
| -0.352000000000217 | 23.999 | 0.749 | 0.098 |
| -0.348000000000217 | 23.999 | 0.749 | 0.098 |
| -0.344000000000217 | 23.999 | 0.749 | 0.098 |
| -0.340000000000217 | 23.999 | 0.749 | 0.098 |
| -0.336000000000217 | 23.999 | 0.75 | 0.098 |
| -0.332000000000217 | 23.999 | 0.75 | 0.098 |
| -0.328000000000217 | 23.999 | 0.75 | 0.098 |
| -0.324000000000217 | 23.999 | 0.75 | 0.098 |
| -0.320000000000217 | 23.999 | 0.75 | 0.098 |
| -0.316000000000217 | 24 | 0.75 | 0.098 |
| -0.312000000000217 | 24 | 0.75 | 0.098 |
| -0.308000000000217 | 24 | 0.75 | 0.099 |
| -0.304000000000217 | 24 | 0.75 | 0.099 |
| -0.300000000000217 | 24 | 0.75 | 0.099 |
| -0.296000000000217 | 24 | 0.75 | 0.099 |
| -0.292000000000217 | 24 | 0.75 | 0.099 |
| -0.288000000000217 | 24 | 0.75 | 0.099 |
| -0.284000000000217 | 24 | 0.75 | 0.099 |
| -0.280000000000217 | 24 | 0.75 | 0.099 |
| -0.276000000000217 | 24 | 0.75 | 0.099 |
| -0.272000000000217 | 24 | 0.75 | 0.099 |
| -0.268000000000217 | 24 | 0.75 | 0.099 |
| -0.264000000000217 | 24 | 0.75 | 0.099 |
| -0.260000000000217 | 24 | 0.75 | 0.099 |
| -0.256000000000217 | 24 | 0.75 | 0.099 |
| -0.252000000000217 | 24 | 0.75 | 0.099 |
| -0.248000000000217 | 24 | 0.75 | 0.099 |
| -0.244000000000217 | 24 | 0.75 | 0.099 |
| -0.240000000000217 | 24 | 0.75 | 0.099 |
| -0.236000000000217 | 24 | 0.75 | 0.099 |
| -0.232000000000217 | 24 | 0.75 | 0.099 |
| -0.228000000000217 | 24 | 0.75 | 0.099 |
| -0.224000000000217 | 24 | 0.75 | 0.099 |
| -0.220000000000217 | 24 | 0.75 | 0.099 |
| -0.216000000000217 | 24 | 0.75 | 0.099 |
| -0.212000000000217 | 24 | 0.75 | 0.099 |
| -0.208000000000217 | 24 | 0.75 | 0.099 |
| -0.204000000000217 | 24 | 0.75 | 0.099 |
| -0.200000000000217 | 24 | 0.75 | 0.099 |
| -0.196000000000217 | 24 | 0.75 | 0.099 |
| -0.192000000000217 | 24 | 0.75 | 0.099 |
| -0.188000000000217 | 24 | 0.75 | 0.099 |
| -0.184000000000217 | 24 | 0.75 | 0.099 |
| -0.180000000000217 | 24 | 0.75 | 0.099 |
| -0.176000000000217 | 24 | 0.75 | 0.099 |
| -0.172000000000217 | 24 | 0.75 | 0.099 |
| -0.168000000000217 | 24 | 0.75 | 0.099 |
| -0.164000000000217 | 24 | 0.75 | 0.099 |
| -0.160000000000217 | 24 | 0.75 | 0.099 |
| -0.156000000000217 | 24 | 0.75 | 0.099 |
| -0.152000000000217 | 24 | 0.75 | 0.099 |
| -0.148000000000217 | 24 | 0.75 | 0.099 |
| -0.144000000000217 | 24 | 0.75 | 0.099 |
| -0.140000000000217 | 24 | 0.75 | 0.099 |
| -0.136000000000217 | 24 | 0.75 | 0.099 |
| -0.132000000000217 | 24 | 0.75 | 0.099 |
| -0.128000000000217 | 24 | 0.75 | 0.099 |
| -0.124000000000217 | 24 | 0.75 | 0.099 |
| -0.120000000000217 | 24 | 0.75 | 0.099 |
| -0.116000000000217 | 24 | 0.75 | 0.099 |
| -0.112000000000217 | 24 | 0.75 | 0.099 |
| -0.108000000000217 | 24 | 0.75 | 0.099 |
| -0.104000000000217 | 24 | 0.75 | 0.099 |
| -0.100000000000217 | 24 | 0.75 | 0.099 |
| -0.0960000000002168 | 24 | 0.75 | 0.099 |
| -0.0920000000002168 | 24 | 0.75 | 0.099 |
| -0.0880000000002168 | 24 | 0.75 | 0.099 |
| -0.0840000000002168 | 24 | 0.75 | 0.099 |
| -0.0800000000002168 | 24 | 0.75 | 0.099 |
| -0.0760000000002168 | 24 | 0.75 | 0.099 |
| -0.0720000000002168 | 24 | 0.75 | 0.099 |
| -0.0680000000002168 | 24 | 0.75 | 0.099 |
| -0.0640000000002168 | 24 | 0.75 | 0.099 |
| -0.0600000000002168 | 24 | 0.75 | 0.099 |
| -0.0560000000002168 | 24 | 0.75 | 0.099 |
| -0.0520000000002168 | 24 | 0.75 | 0.099 |
| -0.0480000000002167 | 24 | 0.75 | 0.099 |
| -0.0440000000002167 | 24 | 0.75 | 0.099 |
| -0.0400000000002167 | 24 | 0.75 | 0.099 |
| -0.0360000000002167 | 24 | 0.75 | 0.099 |
| -0.0320000000002167 | 24 | 0.75 | 0.099 |
| -0.0280000000002167 | 24 | 0.75 | 0.099 |
| -0.0240000000002167 | 24 | 0.75 | 0.099 |
| -0.0200000000002167 | 24 | 0.75 | 0.099 |
| -0.0160000000002167 | 24 | 0.75 | 0.099 |
| -0.0120000000002167 | 24 | 0.75 | 0.099 |
| -0.00800000000021674 | 24 | 0.75 | 0.099 |
| -0.00400000000021674 | 24 | 0.75 | 0.099 |
| -2.16743289982446e-13 | 24 | 0.75 | 0.099 |
| 0.00399999999978326 | 24 | 0.75 | 0.099 |
| 0.00799999999978325 | 24 | 0.75 | 0.099 |
| 0.0119999999997833 | 24 | 0.75 | 0.099 |
| 0.0159999999997833 | 24 | 0.75 | 0.099 |
| 0.0199999999997833 | 24 | 0.75 | 0.099 |
| 0.0239999999997833 | 24 | 0.75 | 0.099 |
| 0.0279999999997833 | 24 | 0.75 | 0.099 |
| 0.0319999999997833 | 24 | 0.75 | 0.099 |
| 0.0359999999997833 | 24 | 0.75 | 0.099 |
| 0.0399999999997833 | 24 | 0.75 | 0.099 |
| 0.0439999999997833 | 24 | 0.75 | 0.099 |
| 0.0479999999997833 | 24 | 0.75 | 0.099 |
| 0.0519999999997833 | 24 | 0.75 | 0.099 |
| 0.0559999999997833 | 24 | 0.75 | 0.099 |
| 0.0599999999997833 | 24 | 0.75 | 0.099 |
| 0.0639999999997833 | 24 | 0.75 | 0.099 |
| 0.0679999999997833 | 24 | 0.75 | 0.099 |
| 0.0719999999997833 | 24 | 0.75 | 0.099 |
| 0.0759999999997833 | 24 | 0.75 | 0.099 |
| 0.0799999999997833 | 24 | 0.75 | 0.099 |
| 0.0839999999997833 | 24 | 0.75 | 0.099 |
| 0.0879999999997833 | 24 | 0.75 | 0.099 |
| 0.0919999999997833 | 24 | 0.75 | 0.099 |
| 0.0959999999997833 | 24 | 0.75 | 0.099 |
| 0.0999999999997833 | 24 | 0.75 | 0.099 |
| 0.103999999999783 | 24 | 0.75 | 0.099 |
| 0.107999999999783 | 24 | 0.75 | 0.099 |
| 0.111999999999783 | 24 | 0.75 | 0.099 |
| 0.115999999999783 | 24 | 0.75 | 0.099 |
| 0.119999999999783 | 24 | 0.75 | 0.099 |
| 0.123999999999783 | 24 | 0.75 | 0.099 |
| 0.127999999999783 | 24 | 0.75 | 0.099 |
| 0.131999999999783 | 24 | 0.75 | 0.099 |
| 0.135999999999783 | 24 | 0.75 | 0.099 |
| 0.139999999999783 | 24 | 0.75 | 0.099 |
| 0.143999999999783 | 24 | 0.75 | 0.099 |
| 0.147999999999783 | 24 | 0.75 | 0.099 |
| 0.151999999999783 | 24 | 0.75 | 0.099 |
| 0.155999999999783 | 24 | 0.75 | 0.099 |
| 0.159999999999783 | 24 | 0.75 | 0.099 |
| 0.163999999999783 | 24 | 0.75 | 0.099 |
| 0.167999999999783 | 24 | 0.75 | 0.099 |
| 0.171999999999783 | 24 | 0.75 | 0.099 |
| 0.175999999999783 | 24 | 0.75 | 0.099 |
| 0.179999999999783 | 24 | 0.75 | 0.099 |
| 0.183999999999783 | 24 | 0.75 | 0.099 |
| 0.187999999999783 | 24 | 0.75 | 0.099 |
| 0.191999999999783 | 24 | 0.75 | 0.099 |
| 0.195999999999783 | 24 | 0.75 | 0.099 |
| 0.199999999999783 | 24 | 0.75 | 0.099 |
| 0.203999999999783 | 24 | 0.75 | 0.099 |
| 0.207999999999783 | 24 | 0.75 | 0.099 |
| 0.211999999999783 | 24 | 0.75 | 0.099 |
| 0.215999999999783 | 24 | 0.75 | 0.099 |
| 0.219999999999783 | 24 | 0.75 | 0.099 |
| 0.223999999999783 | 24 | 0.75 | 0.099 |
| 0.227999999999783 | 24 | 0.75 | 0.099 |
| 0.231999999999783 | 24 | 0.75 | 0.099 |
| 0.235999999999783 | 24 | 0.75 | 0.099 |
| 0.239999999999783 | 24 | 0.75 | 0.099 |
| 0.243999999999783 | 24 | 0.75 | 0.099 |
| 0.247999999999783 | 24 | 0.75 | 0.099 |
| 0.251999999999783 | 24 | 0.75 | 0.099 |
| 0.255999999999783 | 24 | 0.75 | 0.099 |
| 0.259999999999783 | 24 | 0.75 | 0.099 |
| 0.263999999999783 | 24 | 0.75 | 0.099 |
| 0.267999999999783 | 24 | 0.75 | 0.099 |
| 0.271999999999783 | 24 | 0.75 | 0.099 |
| 0.275999999999783 | 24 | 0.751 | 0.099 |
| 0.279999999999783 | 24 | 0.751 | 0.099 |
| 0.283999999999783 | 24 | 0.751 | 0.1 |
| 0.287999999999783 | 24.001 | 0.751 | 0.1 |
| 0.291999999999783 | 24.001 | 0.751 | 0.1 |
| 0.295999999999783 | 24.001 | 0.751 | 0.1 |
| 0.299999999999783 | 24.001 | 0.751 | 0.1 |
| 0.303999999999783 | 24.001 | 0.751 | 0.1 |
| 0.307999999999783 | 24.001 | 0.751 | 0.1 |
| 0.311999999999783 | 24.001 | 0.751 | 0.1 |
| 0.315999999999783 | 24.001 | 0.751 | 0.1 |
| 0.319999999999783 | 24.001 | 0.751 | 0.1 |
| 0.323999999999783 | 24.001 | 0.751 | 0.1 |
| 0.327999999999783 | 24.001 | 0.751 | 0.101 |
| 0.331999999999783 | 24.001 | 0.751 | 0.101 |
| 0.335999999999783 | 24.001 | 0.752 | 0.101 |
| 0.339999999999783 | 24.001 | 0.752 | 0.101 |
| 0.343999999999783 | 24.001 | 0.752 | 0.101 |
| 0.347999999999783 | 24.001 | 0.752 | 0.101 |
| 0.351999999999783 | 24.001 | 0.752 | 0.101 |
| 0.355999999999783 | 24.002 | 0.752 | 0.102 |
| 0.359999999999783 | 24.002 | 0.752 | 0.102 |
| 0.363999999999783 | 24.002 | 0.752 | 0.102 |
| 0.367999999999783 | 24.002 | 0.753 | 0.102 |
| 0.371999999999784 | 24.002 | 0.753 | 0.102 |
| 0.375999999999784 | 24.002 | 0.753 | 0.103 |
| 0.379999999999784 | 24.002 | 0.753 | 0.103 |
| 0.383999999999784 | 24.002 | 0.753 | 0.103 |
| 0.387999999999784 | 24.002 | 0.753 | 0.103 |
| 0.391999999999784 | 24.003 | 0.754 | 0.104 |
| 0.395999999999784 | 24.003 | 0.754 | 0.104 |
| 0.399999999999784 | 24.003 | 0.754 | 0.104 |
| 0.403999999999784 | 24.003 | 0.754 | 0.105 |
| 0.407999999999784 | 24.003 | 0.754 | 0.105 |
| 0.411999999999784 | 24.003 | 0.755 | 0.106 |
| 0.415999999999784 | 24.004 | 0.755 | 0.106 |
| 0.419999999999784 | 24.004 | 0.755 | 0.106 |
| 0.423999999999784 | 24.004 | 0.756 | 0.107 |
| 0.427999999999784 | 24.004 | 0.756 | 0.107 |
| 0.431999999999784 | 24.004 | 0.756 | 0.108 |
| 0.435999999999784 | 24.005 | 0.757 | 0.108 |
| 0.439999999999784 | 24.005 | 0.757 | 0.109 |
| 0.443999999999784 | 24.005 | 0.757 | 0.109 |
| 0.447999999999784 | 24.005 | 0.758 | 0.11 |
| 0.451999999999784 | 24.006 | 0.758 | 0.111 |
| 0.455999999999784 | 24.006 | 0.758 | 0.111 |
| 0.459999999999784 | 24.006 | 0.759 | 0.112 |
| 0.463999999999784 | 24.006 | 0.759 | 0.113 |
| 0.467999999999784 | 24.007 | 0.76 | 0.113 |
| 0.471999999999784 | 24.007 | 0.76 | 0.114 |
| 0.475999999999784 | 24.007 | 0.761 | 0.115 |
| 0.479999999999784 | 24.008 | 0.761 | 0.116 |
| 0.483999999999784 | 24.008 | 0.762 | 0.117 |
| 0.487999999999784 | 24.008 | 0.763 | 0.118 |
| 0.491999999999784 | 24.009 | 0.763 | 0.119 |
| 0.495999999999784 | 24.009 | 0.764 | 0.12 |
| 0.499999999999784 | 24.01 | 0.765 | 0.121 |
| 0.503999999999784 | 24.01 | 0.765 | 0.122 |
| 0.507999999999784 | 24.01 | 0.766 | 0.123 |
| 0.511999999999784 | 24.011 | 0.767 | 0.125 |
| 0.515999999999784 | 24.011 | 0.767 | 0.126 |
| 0.519999999999784 | 24.012 | 0.768 | 0.127 |
| 0.523999999999784 | 24.012 | 0.769 | 0.129 |
| 0.527999999999784 | 24.013 | 0.77 | 0.13 |
| 0.531999999999784 | 24.013 | 0.771 | 0.132 |
| 0.535999999999784 | 24.014 | 0.772 | 0.133 |
| 0.539999999999784 | 24.014 | 0.773 | 0.135 |
| 0.543999999999784 | 24.015 | 0.774 | 0.137 |
| 0.547999999999784 | 24.016 | 0.775 | 0.139 |
| 0.551999999999784 | 24.016 | 0.776 | 0.141 |
| 0.555999999999784 | 24.017 | 0.777 | 0.143 |
| 0.559999999999784 | 24.018 | 0.778 | 0.145 |
| 0.563999999999784 | 24.018 | 0.78 | 0.147 |
| 0.567999999999784 | 24.019 | 0.781 | 0.149 |
| 0.571999999999784 | 24.02 | 0.782 | 0.151 |
| 0.575999999999784 | 24.021 | 0.784 | 0.154 |
| 0.579999999999784 | 24.021 | 0.785 | 0.156 |
| 0.583999999999784 | 24.022 | 0.786 | 0.159 |
| 0.587999999999784 | 24.023 | 0.788 | 0.162 |
| 0.591999999999784 | 24.024 | 0.79 | 0.164 |
| 0.595999999999784 | 24.025 | 0.791 | 0.167 |
| 0.599999999999784 | 24.026 | 0.793 | 0.171 |
| 0.603999999999784 | 24.027 | 0.795 | 0.174 |
| 0.607999999999784 | 24.028 | 0.796 | 0.177 |
| 0.611999999999784 | 24.029 | 0.798 | 0.18 |
| 0.615999999999784 | 24.03 | 0.8 | 0.184 |
| 0.619999999999784 | 24.031 | 0.802 | 0.188 |
| 0.623999999999784 | 24.032 | 0.804 | 0.192 |
| 0.627999999999784 | 24.033 | 0.806 | 0.196 |
| 0.631999999999784 | 24.034 | 0.809 | 0.2 |
| 0.635999999999784 | 24.035 | 0.811 | 0.204 |
| 0.639999999999784 | 24.037 | 0.813 | 0.209 |
| 0.643999999999784 | 24.038 | 0.816 | 0.213 |
| 0.647999999999784 | 24.039 | 0.818 | 0.218 |
| 0.651999999999784 | 24.041 | 0.821 | 0.223 |
| 0.655999999999784 | 24.042 | 0.824 | 0.228 |
| 0.659999999999784 | 24.044 | 0.826 | 0.234 |
| 0.663999999999784 | 24.045 | 0.829 | 0.239 |
| 0.667999999999784 | 24.047 | 0.832 | 0.245 |
| 0.671999999999784 | 24.048 | 0.835 | 0.251 |
| 0.675999999999784 | 24.05 | 0.839 | 0.257 |
| 0.679999999999784 | 24.051 | 0.842 | 0.264 |
| 0.683999999999784 | 24.053 | 0.845 | 0.271 |
| 0.687999999999784 | 24.055 | 0.849 | 0.278 |
| 0.691999999999784 | 24.057 | 0.852 | 0.285 |
| 0.695999999999784 | 24.059 | 0.856 | 0.292 |
| 0.699999999999784 | 24.061 | 0.86 | 0.3 |
| 0.703999999999784 | 24.062 | 0.864 | 0.308 |
| 0.707999999999784 | 24.064 | 0.868 | 0.316 |
| 0.711999999999784 | 24.067 | 0.872 | 0.325 |
| 0.715999999999784 | 24.069 | 0.876 | 0.334 |
| 0.719999999999784 | 24.071 | 0.881 | 0.343 |
| 0.723999999999784 | 24.073 | 0.886 | 0.352 |
| 0.727999999999784 | 24.075 | 0.89 | 0.362 |
| 0.731999999999784 | 24.078 | 0.895 | 0.372 |
| 0.735999999999784 | 24.08 | 0.9 | 0.383 |
| 0.739999999999784 | 24.083 | 0.905 | 0.394 |
| 0.743999999999784 | 24.085 | 0.911 | 0.405 |
| 0.747999999999784 | 24.088 | 0.916 | 0.416 |
| 0.751999999999784 | 24.09 | 0.922 | 0.428 |
| 0.755999999999784 | 24.093 | 0.928 | 0.441 |
| 0.759999999999784 | 24.096 | 0.934 | 0.454 |
| 0.763999999999784 | 24.099 | 0.94 | 0.467 |
| 0.767999999999784 | 24.102 | 0.946 | 0.481 |
| 0.771999999999784 | 24.105 | 0.953 | 0.495 |
| 0.775999999999784 | 24.108 | 0.96 | 0.509 |
| 0.779999999999784 | 24.111 | 0.967 | 0.525 |
| 0.783999999999784 | 24.115 | 0.974 | 0.54 |
| 0.787999999999784 | 24.118 | 0.981 | 0.556 |
| 0.791999999999784 | 24.121 | 0.989 | 0.573 |
| 0.795999999999784 | 24.125 | 0.996 | 0.59 |
| 0.799999999999784 | 24.128 | 1.004 | 0.608 |
| 0.803999999999784 | 24.132 | 1.013 | 0.626 |
| 0.807999999999784 | 24.136 | 1.021 | 0.645 |
| 0.811999999999784 | 24.14 | 1.03 | 0.665 |
| 0.815999999999784 | 24.144 | 1.039 | 0.685 |
| 0.819999999999784 | 24.148 | 1.048 | 0.706 |
| 0.823999999999784 | 24.152 | 1.057 | 0.727 |
| 0.827999999999784 | 24.156 | 1.067 | 0.75 |
| 0.831999999999784 | 24.161 | 1.077 | 0.772 |
| 0.835999999999784 | 24.165 | 1.087 | 0.796 |
| 0.839999999999784 | 24.17 | 1.098 | 0.82 |
| 0.843999999999784 | 24.174 | 1.109 | 0.846 |
| 0.847999999999784 | 24.179 | 1.12 | 0.871 |
| 0.851999999999784 | 24.184 | 1.131 | 0.898 |
| 0.855999999999784 | 24.189 | 1.143 | 0.926 |
| 0.859999999999784 | 24.194 | 1.155 | 0.954 |
| 0.863999999999784 | 24.199 | 1.168 | 0.984 |
| 0.867999999999784 | 24.205 | 1.18 | 1.014 |
| 0.871999999999784 | 24.21 | 1.193 | 1.045 |
| 0.875999999999784 | 24.216 | 1.207 | 1.077 |
| 0.879999999999784 | 24.221 | 1.22 | 1.11 |
| 0.883999999999784 | 24.227 | 1.235 | 1.144 |
| 0.887999999999784 | 24.233 | 1.249 | 1.179 |
| 0.891999999999784 | 24.239 | 1.264 | 1.216 |
| 0.895999999999784 | 24.246 | 1.279 | 1.253 |
| 0.899999999999784 | 24.252 | 1.295 | 1.292 |
| 0.903999999999784 | 24.258 | 1.311 | 1.331 |
| 0.907999999999784 | 24.265 | 1.328 | 1.372 |
| 0.911999999999784 | 24.272 | 1.344 | 1.414 |
| 0.915999999999784 | 24.279 | 1.362 | 1.457 |
| 0.919999999999784 | 24.286 | 1.38 | 1.502 |
| 0.923999999999784 | 24.293 | 1.398 | 1.548 |
| 0.927999999999784 | 24.301 | 1.417 | 1.595 |
| 0.931999999999784 | 24.308 | 1.436 | 1.644 |
| 0.935999999999784 | 24.316 | 1.456 | 1.694 |
| 0.939999999999784 | 24.324 | 1.476 | 1.746 |
| 0.943999999999784 | 24.332 | 1.497 | 1.799 |
| 0.947999999999784 | 24.34 | 1.518 | 1.854 |
| 0.951999999999784 | 24.349 | 1.54 | 1.91 |
| 0.955999999999784 | 24.357 | 1.562 | 1.968 |
| 0.959999999999784 | 24.366 | 1.585 | 2.028 |
| 0.963999999999784 | 24.375 | 1.608 | 2.089 |
| 0.967999999999784 | 24.384 | 1.632 | 2.152 |
| 0.971999999999784 | 24.394 | 1.657 | 2.217 |
| 0.975999999999784 | 24.403 | 1.682 | 2.284 |
| 0.979999999999784 | 24.413 | 1.708 | 2.353 |
| 0.983999999999784 | 24.423 | 1.735 | 2.424 |
| 0.987999999999784 | 24.433 | 1.762 | 2.497 |
| 0.991999999999784 | 24.443 | 1.79 | 2.571 |
| 0.995999999999784 | 24.454 | 1.818 | 2.648 |
| 0.999999999999784 | 24.465 | 1.847 | 2.728 |
| 1.003999999999784 | 24.476 | 1.877 | 2.809 |
| 1.007999999999784 | 24.487 | 1.908 | 2.893 |
| 1.011999999999784 | 24.498 | 1.939 | 2.979 |
| 1.015999999999784 | 24.51 | 1.971 | 3.068 |
| 1.019999999999784 | 24.522 | 2.004 | 3.159 |
| 1.023999999999784 | 24.534 | 2.038 | 3.252 |
| 1.027999999999784 | 24.546 | 2.072 | 3.349 |
| 1.031999999999784 | 24.559 | 2.108 | 3.448 |
| 1.035999999999784 | 24.572 | 2.144 | 3.549 |
| 1.039999999999784 | 24.585 | 2.181 | 3.654 |
| 1.043999999999784 | 24.598 | 2.219 | 3.761 |
| 1.047999999999784 | 24.612 | 2.258 | 3.872 |
| 1.051999999999784 | 24.626 | 2.297 | 3.985 |
| 1.055999999999784 | 24.64 | 2.338 | 4.102 |
| 1.059999999999784 | 24.654 | 2.38 | 4.222 |
| 1.063999999999784 | 24.669 | 2.422 | 4.345 |
| 1.067999999999784 | 24.684 | 2.466 | 4.471 |
| 1.071999999999784 | 24.699 | 2.51 | 4.601 |
| 1.075999999999784 | 24.715 | 2.556 | 4.734 |
| 1.079999999999784 | 24.731 | 2.602 | 4.872 |
| 1.083999999999784 | 24.747 | 2.65 | 5.012 |
| 1.087999999999784 | 24.763 | 2.699 | 5.157 |
| 1.091999999999784 | 24.78 | 2.749 | 5.306 |
| 1.095999999999784 | 24.797 | 2.8 | 5.458 |
| 1.099999999999784 | 24.815 | 2.852 | 5.615 |
| 1.103999999999784 | 24.832 | 2.906 | 5.776 |
| 1.107999999999784 | 24.851 | 2.96 | 5.941 |
| 1.111999999999784 | 24.869 | 3.016 | 6.111 |
| 1.115999999999784 | 24.888 | 3.074 | 6.285 |
| 1.119999999999784 | 24.907 | 3.132 | 6.464 |
| 1.123999999999784 | 24.926 | 3.192 | 6.647 |
| 1.127999999999784 | 24.946 | 3.253 | 6.836 |
| 1.131999999999784 | 24.966 | 3.315 | 7.029 |
| 1.135999999999784 | 24.987 | 3.379 | 7.228 |
| 1.139999999999784 | 25.008 | 3.445 | 7.432 |
| 1.143999999999784 | 25.029 | 3.511 | 7.641 |
| 1.147999999999784 | 25.051 | 3.58 | 7.856 |
| 1.151999999999784 | 25.073 | 3.65 | 8.076 |
| 1.155999999999784 | 25.095 | 3.721 | 8.302 |
| 1.159999999999784 | 25.118 | 3.794 | 8.534 |
| 1.163999999999784 | 25.142 | 3.868 | 8.772 |
| 1.167999999999784 | 25.165 | 3.944 | 9.017 |
| 1.171999999999784 | 25.19 | 4.022 | 9.268 |
| 1.175999999999784 | 25.214 | 4.102 | 9.525 |
| 1.179999999999784 | 25.239 | 4.183 | 9.789 |
| 1.183999999999784 | 25.265 | 4.266 | 10.059 |
| 1.187999999999784 | 25.291 | 4.351 | 10.337 |
| 1.191999999999784 | 25.317 | 4.437 | 10.622 |
| 1.195999999999784 | 25.344 | 4.526 | 10.914 |
| 1.199999999999784 | 25.371 | 4.617 | 11.214 |
| 1.203999999999784 | 25.399 | 4.709 | 11.521 |
| 1.207999999999784 | 25.427 | 4.803 | 11.837 |
| 1.211999999999784 | 25.456 | 4.9 | 12.16 |
| 1.215999999999784 | 25.485 | 4.998 | 12.492 |
| 1.219999999999784 | 25.515 | 5.099 | 12.832 |
| 1.223999999999784 | 25.545 | 5.202 | 13.181 |
| 1.227999999999784 | 25.576 | 5.307 | 13.538 |
| 1.231999999999784 | 25.607 | 5.414 | 13.905 |
| 1.235999999999784 | 25.639 | 5.523 | 14.281 |
| 1.239999999999784 | 25.671 | 5.635 | 14.666 |
| 1.243999999999784 | 25.704 | 5.749 | 15.061 |
| 1.247999999999784 | 25.738 | 5.866 | 15.466 |
| 1.251999999999784 | 25.772 | 5.984 | 15.882 |
| 1.255999999999784 | 25.807 | 6.106 | 16.307 |
| 1.259999999999784 | 25.842 | 6.23 | 16.744 |
| 1.263999999999784 | 25.878 | 6.357 | 17.191 |
| 1.267999999999784 | 25.914 | 6.486 | 17.649 |
| 1.271999999999784 | 25.951 | 6.618 | 18.119 |
| 1.275999999999784 | 25.989 | 6.752 | 18.601 |
| 1.279999999999784 | 26.027 | 6.89 | 19.094 |
| 1.283999999999784 | 26.066 | 7.03 | 19.6 |
| 1.287999999999784 | 26.106 | 7.174 | 20.118 |
| 1.291999999999784 | 26.146 | 7.32 | 20.649 |
| 1.295999999999784 | 26.187 | 7.469 | 21.193 |
| 1.299999999999784 | 26.228 | 7.621 | 21.751 |
| 1.303999999999784 | 26.271 | 7.777 | 22.322 |
| 1.307999999999784 | 26.314 | 7.935 | 22.908 |
| 1.311999999999784 | 26.357 | 8.097 | 23.507 |
| 1.315999999999784 | 26.402 | 8.262 | 24.122 |
| 1.319999999999784 | 26.447 | 8.43 | 24.751 |
| 1.323999999999784 | 26.493 | 8.602 | 25.396 |
| 1.327999999999784 | 26.539 | 8.778 | 26.056 |
| 1.331999999999784 | 26.587 | 8.957 | 26.733 |
| 1.335999999999784 | 26.635 | 9.139 | 27.426 |
| 1.339999999999784 | 26.684 | 9.325 | 28.136 |
| 1.343999999999784 | 26.733 | 9.515 | 28.863 |
| 1.347999999999784 | 26.784 | 9.709 | 29.607 |
| 1.351999999999784 | 26.835 | 9.907 | 30.37 |
| 1.355999999999784 | 26.887 | 10.109 | 31.151 |
| 1.359999999999784 | 26.94 | 10.314 | 31.951 |
| 1.363999999999784 | 26.994 | 10.524 | 32.77 |
| 1.367999999999784 | 27.048 | 10.738 | 33.609 |
| 1.371999999999784 | 27.104 | 10.956 | 34.467 |
| 1.375999999999784 | 27.16 | 11.179 | 35.347 |
| 1.379999999999784 | 27.217 | 11.406 | 36.247 |
| 1.383999999999784 | 27.275 | 11.637 | 37.169 |
| 1.387999999999784 | 27.334 | 11.873 | 38.113 |
| 1.391999999999784 | 27.394 | 12.114 | 39.079 |
| 1.395999999999784 | 27.455 | 12.36 | 40.069 |
| 1.399999999999784 | 27.517 | 12.61 | 41.081 |
| 1.403999999999784 | 27.58 | 12.865 | 42.118 |
| 1.407999999999784 | 27.644 | 13.125 | 43.18 |
| 1.411999999999784 | 27.708 | 13.39 | 44.266 |
| 1.415999999999784 | 27.774 | 13.661 | 45.378 |
| 1.419999999999784 | 27.841 | 13.936 | 46.516 |
| 1.423999999999784 | 27.909 | 14.218 | 47.682 |
| 1.427999999999784 | 27.977 | 14.504 | 48.874 |
| 1.431999999999784 | 28.047 | 14.796 | 50.095 |
| 1.435999999999784 | 28.118 | 15.094 | 51.344 |
| 1.439999999999784 | 28.19 | 15.397 | 52.622 |
| 1.443999999999784 | 28.264 | 15.707 | 53.93 |
| 1.447999999999784 | 28.338 | 16.022 | 55.269 |
| 1.451999999999784 | 28.413 | 16.343 | 56.639 |
| 1.455999999999784 | 28.49 | 16.671 | 58.041 |
| 1.459999999999784 | 28.567 | 17.005 | 59.475 |
| 1.463999999999784 | 28.646 | 17.345 | 60.943 |
| 1.467999999999784 | 28.726 | 17.692 | 62.445 |
| 1.471999999999784 | 28.807 | 18.045 | 63.982 |
| 1.475999999999784 | 28.89 | 18.405 | 65.554 |
| 1.479999999999784 | 28.974 | 18.772 | 67.163 |
| 1.483999999999784 | 29.059 | 19.146 | 68.808 |
| 1.487999999999784 | 29.145 | 19.527 | 70.492 |
| 1.491999999999784 | 29.232 | 19.915 | 72.214 |
| 1.495999999999784 | 29.321 | 20.31 | 73.976 |
| 1.499999999999784 | 29.411 | 20.713 | 75.778 |
| 1.503999999999784 | 29.503 | 21.124 | 77.622 |
| 1.507999999999784 | 29.595 | 21.542 | 79.508 |
| 1.511999999999784 | 29.689 | 21.968 | 81.437 |
| 1.515999999999784 | 29.785 | 22.402 | 83.41 |
| 1.519999999999784 | 29.882 | 22.845 | 85.428 |
| 1.523999999999784 | 29.98 | 23.295 | 87.492 |
| 1.527999999999784 | 30.08 | 23.754 | 89.603 |
| 1.531999999999784 | 30.181 | 24.221 | 91.762 |
| 1.535999999999784 | 30.284 | 24.698 | 93.97 |
| 1.539999999999784 | 30.388 | 25.183 | 96.228 |
| 1.543999999999784 | 30.494 | 25.677 | 98.537 |
| 1.547999999999784 | 30.601 | 26.18 | 100.898 |
| 1.551999999999784 | 30.71 | 26.692 | 103.313 |
| 1.555999999999784 | 30.82 | 27.214 | 105.782 |
| 1.559999999999784 | 30.932 | 27.746 | 108.307 |
| 1.563999999999784 | 31.046 | 28.287 | 110.889 |
| 1.567999999999784 | 31.161 | 28.839 | 113.528 |
| 1.571999999999784 | 31.278 | 29.4 | 116.227 |
| 1.575999999999784 | 31.396 | 29.972 | 118.987 |
| 1.579999999999784 | 31.516 | 30.554 | 121.808 |
| 1.583999999999784 | 31.638 | 31.147 | 124.693 |
| 1.587999999999784 | 31.762 | 31.751 | 127.641 |
| 1.591999999999784 | 31.887 | 32.366 | 130.656 |
| 1.595999999999784 | 32.014 | 32.992 | 133.738 |
| 1.599999999999784 | 32.143 | 33.629 | 136.889 |
| 1.603999999999784 | 32.274 | 34.278 | 140.109 |
| 1.607999999999784 | 32.407 | 34.939 | 143.401 |
| 1.611999999999784 | 32.541 | 35.611 | 146.767 |
| 1.615999999999784 | 32.677 | 36.296 | 150.206 |
| 1.619999999999784 | 32.816 | 36.994 | 153.722 |
| 1.623999999999784 | 32.956 | 37.703 | 157.316 |
| 1.627999999999784 | 33.098 | 38.426 | 160.989 |
| 1.631999999999784 | 33.242 | 39.161 | 164.743 |
| 1.635999999999784 | 33.388 | 39.91 | 168.58 |
| 1.639999999999784 | 33.536 | 40.672 | 172.502 |
| 1.643999999999784 | 33.686 | 41.448 | 176.51 |
| 1.647999999999784 | 33.839 | 42.238 | 180.605 |
| 1.651999999999784 | 33.993 | 43.042 | 184.791 |
| 1.655999999999784 | 34.15 | 43.86 | 189.068 |
| 1.659999999999784 | 34.308 | 44.693 | 193.439 |
| 1.663999999999784 | 34.469 | 45.54 | 197.906 |
| 1.667999999999784 | 34.632 | 46.403 | 202.47 |
| 1.671999999999784 | 34.797 | 47.281 | 207.134 |
| 1.675999999999784 | 34.965 | 48.174 | 211.9 |
| 1.679999999999784 | 35.135 | 49.084 | 216.769 |
| 1.683999999999784 | 35.307 | 50.009 | 221.745 |
| 1.687999999999784 | 35.481 | 50.951 | 226.828 |
| 1.691999999999784 | 35.658 | 51.909 | 232.022 |
| 1.695999999999784 | 35.837 | 52.885 | 237.328 |
| 1.699999999999784 | 36.019 | 53.877 | 242.75 |
| 1.703999999999785 | 36.203 | 54.887 | 248.289 |
| 1.707999999999785 | 36.39 | 55.914 | 253.947 |
| 1.711999999999785 | 36.579 | 56.96 | 259.728 |
| 1.715999999999785 | 36.771 | 58.024 | 265.633 |
| 1.719999999999785 | 36.965 | 59.106 | 271.666 |
| 1.723999999999785 | 37.162 | 60.207 | 277.829 |
| 1.727999999999785 | 37.361 | 61.328 | 284.124 |
| 1.731999999999785 | 37.563 | 62.468 | 290.554 |
| 1.735999999999785 | 37.768 | 63.628 | 297.123 |
| 1.739999999999785 | 37.975 | 64.808 | 303.832 |
| 1.743999999999785 | 38.186 | 66.008 | 310.685 |
| 1.747999999999785 | 38.399 | 67.229 | 317.685 |
| 1.751999999999785 | 38.615 | 68.472 | 324.834 |
| 1.755999999999785 | 38.833 | 69.736 | 332.136 |
| 1.759999999999785 | 39.055 | 71.021 | 339.594 |
| 1.763999999999785 | 39.28 | 72.329 | 347.211 |
| 1.767999999999785 | 39.507 | 73.659 | 354.99 |
| 1.771999999999785 | 39.738 | 75.012 | 362.934 |
| 1.775999999999785 | 39.971 | 76.389 | 371.047 |
| 1.779999999999785 | 40.208 | 77.789 | 379.333 |
| 1.783999999999785 | 40.447 | 79.213 | 387.794 |
| 1.787999999999785 | 40.69 | 80.661 | 396.435 |
| 1.791999999999785 | 40.936 | 82.135 | 405.258 |
| 1.795999999999785 | 41.185 | 83.633 | 414.269 |
| 1.799999999999785 | 41.438 | 85.157 | 423.469 |
| 1.803999999999785 | 41.693 | 86.707 | 432.864 |
| 1.807999999999785 | 41.952 | 88.283 | 442.457 |
| 1.811999999999785 | 42.215 | 89.886 | 452.251 |
| 1.815999999999785 | 42.48 | 91.516 | 462.253 |
| 1.819999999999785 | 42.75 | 93.174 | 472.464 |
| 1.823999999999785 | 43.022 | 94.86 | 482.89 |
| 1.827999999999785 | 43.298 | 96.574 | 493.535 |
| 1.831999999999785 | 43.578 | 98.317 | 504.403 |
| 1.835999999999785 | 43.861 | 100.09 | 515.498 |
| 1.839999999999785 | 44.148 | 101.893 | 526.826 |
| 1.843999999999785 | 44.439 | 103.726 | 538.391 |
| 1.847999999999785 | 44.733 | 105.59 | 550.197 |
| 1.851999999999785 | 45.031 | 107.485 | 562.25 |
| 1.855999999999785 | 45.333 | 109.412 | 574.554 |
| 1.859999999999785 | 45.638 | 111.371 | 587.115 |
| 1.863999999999785 | 45.948 | 113.363 | 599.937 |
| 1.867999999999785 | 46.261 | 115.388 | 613.025 |
| 1.871999999999785 | 46.578 | 117.447 | 626.386 |
| 1.875999999999785 | 46.9 | 119.541 | 640.024 |
| 1.879999999999785 | 47.225 | 121.669 | 653.945 |
| 1.883999999999785 | 47.555 | 123.833 | 668.154 |
| 1.887999999999785 | 47.888 | 126.033 | 682.658 |
| 1.891999999999785 | 48.226 | 128.27 | 697.461 |
| 1.895999999999785 | 48.568 | 130.543 | 712.57 |
| 1.899999999999785 | 48.915 | 132.854 | 727.992 |
| 1.903999999999785 | 49.265 | 135.204 | 743.732 |
| 1.907999999999785 | 49.62 | 137.592 | 759.796 |
| 1.911999999999785 | 49.98 | 140.02 | 776.19 |
| 1.915999999999785 | 50.344 | 142.487 | 792.923 |
| 1.919999999999785 | 50.712 | 144.996 | 809.999 |
| 1.923999999999785 | 51.085 | 147.546 | 827.426 |
| 1.927999999999785 | 51.463 | 150.137 | 845.211 |
| 1.931999999999785 | 51.846 | 152.772 | 863.36 |
| 1.935999999999785 | 52.233 | 155.449 | 881.881 |
| 1.939999999999785 | 52.625 | 158.171 | 900.782 |
| 1.943999999999785 | 53.021 | 160.937 | 920.068 |
| 1.947999999999785 | 53.423 | 163.748 | 939.75 |
| 1.951999999999785 | 53.829 | 166.605 | 959.833 |
| 1.955999999999785 | 54.241 | 169.509 | 980.325 |
| 1.959999999999785 | 54.657 | 172.461 | 1001.236 |
| 1.963999999999785 | 55.079 | 175.46 | 1022.572 |
| 1.967999999999785 | 55.506 | 178.508 | 1044.343 |
| 1.971999999999785 | 55.938 | 181.606 | 1066.556 |
| 1.975999999999785 | 56.375 | 184.754 | 1089.221 |
| 1.979999999999785 | 56.818 | 187.953 | 1112.345 |
| 1.983999999999785 | 57.266 | 191.204 | 1135.939 |
| 1.987999999999785 | 57.719 | 194.508 | 1160.011 |
| 1.991999999999785 | 58.178 | 197.865 | 1184.57 |
| 1.995999999999785 | 58.642 | 201.277 | 1209.626 |
| 1.999999999999785 | 59.112 | 204.743 | 1235.189 |